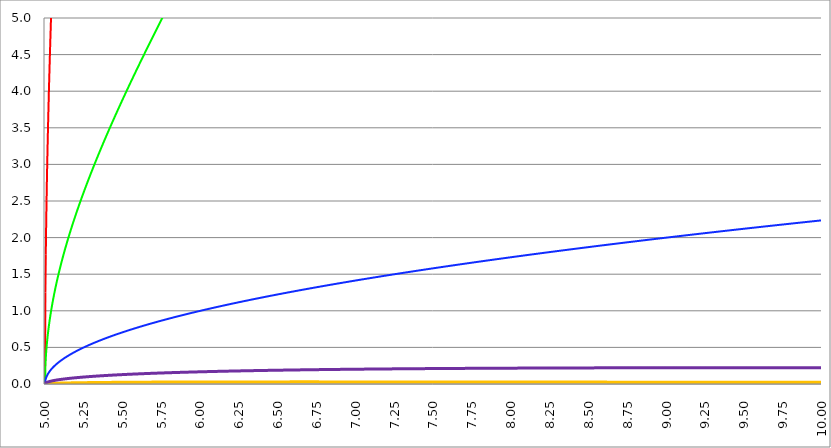
| Category | Series 1 | Series 0 | Series 2 | Series 3 | Series 4 |
|---|---|---|---|---|---|
| 5.0 | 0 | 0 | 0 | 0 | 0 |
| 5.0025 | 1.251 | 0.25 | 0.05 | 0.002 | 0.01 |
| 5.005000000000001 | 1.771 | 0.354 | 0.071 | 0.003 | 0.014 |
| 5.007500000000001 | 2.172 | 0.434 | 0.087 | 0.003 | 0.017 |
| 5.010000000000002 | 2.51 | 0.501 | 0.1 | 0.004 | 0.02 |
| 5.012500000000002 | 2.809 | 0.56 | 0.112 | 0.004 | 0.022 |
| 5.015000000000002 | 3.08 | 0.614 | 0.122 | 0.005 | 0.024 |
| 5.017500000000003 | 3.33 | 0.664 | 0.132 | 0.005 | 0.026 |
| 5.020000000000003 | 3.564 | 0.71 | 0.141 | 0.006 | 0.028 |
| 5.022500000000004 | 3.784 | 0.753 | 0.15 | 0.006 | 0.03 |
| 5.025000000000004 | 3.992 | 0.795 | 0.158 | 0.006 | 0.031 |
| 5.027500000000004 | 4.192 | 0.834 | 0.166 | 0.007 | 0.033 |
| 5.030000000000004 | 4.382 | 0.871 | 0.173 | 0.007 | 0.034 |
| 5.032500000000005 | 4.566 | 0.907 | 0.18 | 0.007 | 0.036 |
| 5.035000000000005 | 4.743 | 0.942 | 0.187 | 0.007 | 0.037 |
| 5.037500000000006 | 4.914 | 0.976 | 0.194 | 0.008 | 0.038 |
| 5.040000000000006 | 5.08 | 1.008 | 0.2 | 0.008 | 0.04 |
| 5.042500000000007 | 5.242 | 1.04 | 0.206 | 0.008 | 0.041 |
| 5.045000000000007 | 5.399 | 1.07 | 0.212 | 0.008 | 0.042 |
| 5.047500000000007 | 5.553 | 1.1 | 0.218 | 0.009 | 0.043 |
| 5.050000000000008 | 5.703 | 1.129 | 0.224 | 0.009 | 0.044 |
| 5.052500000000008 | 5.849 | 1.158 | 0.229 | 0.009 | 0.045 |
| 5.055000000000009 | 5.993 | 1.186 | 0.235 | 0.009 | 0.046 |
| 5.057500000000009 | 6.133 | 1.213 | 0.24 | 0.009 | 0.047 |
| 5.060000000000009 | 6.272 | 1.239 | 0.245 | 0.01 | 0.048 |
| 5.06250000000001 | 6.407 | 1.266 | 0.25 | 0.01 | 0.049 |
| 5.06500000000001 | 6.541 | 1.291 | 0.255 | 0.01 | 0.05 |
| 5.067500000000011 | 6.672 | 1.317 | 0.26 | 0.01 | 0.051 |
| 5.070000000000011 | 6.801 | 1.341 | 0.265 | 0.01 | 0.052 |
| 5.072500000000011 | 6.928 | 1.366 | 0.269 | 0.01 | 0.053 |
| 5.075000000000012 | 7.053 | 1.39 | 0.274 | 0.011 | 0.054 |
| 5.077500000000012 | 7.177 | 1.414 | 0.278 | 0.011 | 0.055 |
| 5.080000000000012 | 7.299 | 1.437 | 0.283 | 0.011 | 0.056 |
| 5.082500000000013 | 7.42 | 1.46 | 0.287 | 0.011 | 0.057 |
| 5.085000000000013 | 7.539 | 1.483 | 0.292 | 0.011 | 0.057 |
| 5.087500000000014 | 7.656 | 1.505 | 0.296 | 0.011 | 0.058 |
| 5.090000000000014 | 7.772 | 1.527 | 0.3 | 0.012 | 0.059 |
| 5.092500000000014 | 7.887 | 1.549 | 0.304 | 0.012 | 0.06 |
| 5.095000000000015 | 8.001 | 1.57 | 0.308 | 0.012 | 0.06 |
| 5.097500000000015 | 8.114 | 1.592 | 0.312 | 0.012 | 0.061 |
| 5.100000000000016 | 8.225 | 1.613 | 0.316 | 0.012 | 0.062 |
| 5.102500000000016 | 8.335 | 1.634 | 0.32 | 0.012 | 0.063 |
| 5.105000000000016 | 8.445 | 1.654 | 0.324 | 0.012 | 0.063 |
| 5.107500000000017 | 8.553 | 1.675 | 0.328 | 0.013 | 0.064 |
| 5.110000000000017 | 8.66 | 1.695 | 0.332 | 0.013 | 0.065 |
| 5.112500000000018 | 8.767 | 1.715 | 0.335 | 0.013 | 0.066 |
| 5.115000000000018 | 8.872 | 1.735 | 0.339 | 0.013 | 0.066 |
| 5.117500000000018 | 8.977 | 1.754 | 0.343 | 0.013 | 0.067 |
| 5.120000000000019 | 9.081 | 1.774 | 0.346 | 0.013 | 0.068 |
| 5.122500000000019 | 9.184 | 1.793 | 0.35 | 0.013 | 0.068 |
| 5.12500000000002 | 9.286 | 1.812 | 0.354 | 0.013 | 0.069 |
| 5.12750000000002 | 9.388 | 1.831 | 0.357 | 0.014 | 0.07 |
| 5.13000000000002 | 9.489 | 1.85 | 0.361 | 0.014 | 0.07 |
| 5.132500000000021 | 9.589 | 1.868 | 0.364 | 0.014 | 0.071 |
| 5.135000000000021 | 9.688 | 1.887 | 0.367 | 0.014 | 0.072 |
| 5.137500000000021 | 9.787 | 1.905 | 0.371 | 0.014 | 0.072 |
| 5.140000000000022 | 9.885 | 1.923 | 0.374 | 0.014 | 0.073 |
| 5.142500000000022 | 9.983 | 1.941 | 0.377 | 0.014 | 0.073 |
| 5.145000000000023 | 10.08 | 1.959 | 0.381 | 0.014 | 0.074 |
| 5.147500000000023 | 10.176 | 1.977 | 0.384 | 0.014 | 0.075 |
| 5.150000000000023 | 10.272 | 1.995 | 0.387 | 0.015 | 0.075 |
| 5.152500000000024 | 10.367 | 2.012 | 0.391 | 0.015 | 0.076 |
| 5.155000000000024 | 10.462 | 2.03 | 0.394 | 0.015 | 0.076 |
| 5.157500000000025 | 10.556 | 2.047 | 0.397 | 0.015 | 0.077 |
| 5.160000000000025 | 10.65 | 2.064 | 0.4 | 0.015 | 0.078 |
| 5.162500000000025 | 10.744 | 2.081 | 0.403 | 0.015 | 0.078 |
| 5.165000000000026 | 10.836 | 2.098 | 0.406 | 0.015 | 0.079 |
| 5.167500000000026 | 10.929 | 2.115 | 0.409 | 0.015 | 0.079 |
| 5.170000000000026 | 11.021 | 2.132 | 0.412 | 0.015 | 0.08 |
| 5.172500000000027 | 11.112 | 2.148 | 0.415 | 0.016 | 0.08 |
| 5.175000000000027 | 11.203 | 2.165 | 0.418 | 0.016 | 0.081 |
| 5.177500000000028 | 11.294 | 2.181 | 0.421 | 0.016 | 0.081 |
| 5.180000000000028 | 11.384 | 2.198 | 0.424 | 0.016 | 0.082 |
| 5.182500000000029 | 11.474 | 2.214 | 0.427 | 0.016 | 0.082 |
| 5.185000000000029 | 11.563 | 2.23 | 0.43 | 0.016 | 0.083 |
| 5.187500000000029 | 11.652 | 2.246 | 0.433 | 0.016 | 0.083 |
| 5.19000000000003 | 11.741 | 2.262 | 0.436 | 0.016 | 0.084 |
| 5.19250000000003 | 11.83 | 2.278 | 0.439 | 0.016 | 0.084 |
| 5.19500000000003 | 11.918 | 2.294 | 0.442 | 0.016 | 0.085 |
| 5.197500000000031 | 12.005 | 2.31 | 0.444 | 0.016 | 0.086 |
| 5.200000000000031 | 12.093 | 2.326 | 0.447 | 0.017 | 0.086 |
| 5.202500000000032 | 12.18 | 2.341 | 0.45 | 0.017 | 0.086 |
| 5.205000000000032 | 12.266 | 2.357 | 0.453 | 0.017 | 0.087 |
| 5.207500000000032 | 12.353 | 2.372 | 0.456 | 0.017 | 0.087 |
| 5.210000000000033 | 12.439 | 2.388 | 0.458 | 0.017 | 0.088 |
| 5.212500000000033 | 12.525 | 2.403 | 0.461 | 0.017 | 0.088 |
| 5.215000000000034 | 12.61 | 2.418 | 0.464 | 0.017 | 0.089 |
| 5.217500000000034 | 12.696 | 2.433 | 0.466 | 0.017 | 0.089 |
| 5.220000000000034 | 12.781 | 2.448 | 0.469 | 0.017 | 0.09 |
| 5.222500000000035 | 12.865 | 2.463 | 0.472 | 0.017 | 0.09 |
| 5.225000000000035 | 12.95 | 2.478 | 0.474 | 0.017 | 0.091 |
| 5.227500000000036 | 13.034 | 2.493 | 0.477 | 0.017 | 0.091 |
| 5.230000000000035 | 13.118 | 2.508 | 0.48 | 0.018 | 0.092 |
| 5.232500000000036 | 13.202 | 2.523 | 0.482 | 0.018 | 0.092 |
| 5.235000000000036 | 13.285 | 2.538 | 0.485 | 0.018 | 0.093 |
| 5.237500000000037 | 13.368 | 2.552 | 0.487 | 0.018 | 0.093 |
| 5.240000000000037 | 13.451 | 2.567 | 0.49 | 0.018 | 0.093 |
| 5.242500000000038 | 13.534 | 2.582 | 0.492 | 0.018 | 0.094 |
| 5.245000000000038 | 13.617 | 2.596 | 0.495 | 0.018 | 0.094 |
| 5.247500000000039 | 13.699 | 2.611 | 0.497 | 0.018 | 0.095 |
| 5.25000000000004 | 13.781 | 2.625 | 0.5 | 0.018 | 0.095 |
| 5.252500000000039 | 13.863 | 2.639 | 0.502 | 0.018 | 0.096 |
| 5.25500000000004 | 13.945 | 2.654 | 0.505 | 0.018 | 0.096 |
| 5.25750000000004 | 14.026 | 2.668 | 0.507 | 0.018 | 0.097 |
| 5.260000000000041 | 14.108 | 2.682 | 0.51 | 0.018 | 0.097 |
| 5.262500000000041 | 14.189 | 2.696 | 0.512 | 0.019 | 0.097 |
| 5.265000000000041 | 14.27 | 2.71 | 0.515 | 0.019 | 0.098 |
| 5.267500000000042 | 14.351 | 2.724 | 0.517 | 0.019 | 0.098 |
| 5.270000000000042 | 14.431 | 2.738 | 0.52 | 0.019 | 0.099 |
| 5.272500000000043 | 14.512 | 2.752 | 0.522 | 0.019 | 0.099 |
| 5.275000000000043 | 14.592 | 2.766 | 0.524 | 0.019 | 0.099 |
| 5.277500000000043 | 14.672 | 2.78 | 0.527 | 0.019 | 0.1 |
| 5.280000000000044 | 14.752 | 2.794 | 0.529 | 0.019 | 0.1 |
| 5.282500000000044 | 14.832 | 2.808 | 0.532 | 0.019 | 0.101 |
| 5.285000000000044 | 14.911 | 2.821 | 0.534 | 0.019 | 0.101 |
| 5.287500000000045 | 14.991 | 2.835 | 0.536 | 0.019 | 0.101 |
| 5.290000000000045 | 15.07 | 2.849 | 0.539 | 0.019 | 0.102 |
| 5.292500000000046 | 15.149 | 2.862 | 0.541 | 0.019 | 0.102 |
| 5.295000000000046 | 15.228 | 2.876 | 0.543 | 0.019 | 0.103 |
| 5.297500000000046 | 15.307 | 2.889 | 0.545 | 0.019 | 0.103 |
| 5.300000000000047 | 15.386 | 2.903 | 0.548 | 0.019 | 0.103 |
| 5.302500000000047 | 15.464 | 2.916 | 0.55 | 0.02 | 0.104 |
| 5.305000000000048 | 15.542 | 2.93 | 0.552 | 0.02 | 0.104 |
| 5.307500000000048 | 15.621 | 2.943 | 0.555 | 0.02 | 0.104 |
| 5.310000000000048 | 15.699 | 2.956 | 0.557 | 0.02 | 0.105 |
| 5.312500000000049 | 15.777 | 2.97 | 0.559 | 0.02 | 0.105 |
| 5.315000000000049 | 15.855 | 2.983 | 0.561 | 0.02 | 0.106 |
| 5.31750000000005 | 15.933 | 2.996 | 0.563 | 0.02 | 0.106 |
| 5.32000000000005 | 16.01 | 3.009 | 0.566 | 0.02 | 0.106 |
| 5.32250000000005 | 16.088 | 3.023 | 0.568 | 0.02 | 0.107 |
| 5.325000000000051 | 16.165 | 3.036 | 0.57 | 0.02 | 0.107 |
| 5.327500000000051 | 16.242 | 3.049 | 0.572 | 0.02 | 0.107 |
| 5.330000000000052 | 16.32 | 3.062 | 0.574 | 0.02 | 0.108 |
| 5.332500000000052 | 16.397 | 3.075 | 0.577 | 0.02 | 0.108 |
| 5.335000000000052 | 16.474 | 3.088 | 0.579 | 0.02 | 0.108 |
| 5.337500000000053 | 16.551 | 3.101 | 0.581 | 0.02 | 0.109 |
| 5.340000000000053 | 16.627 | 3.114 | 0.583 | 0.02 | 0.109 |
| 5.342500000000053 | 16.704 | 3.127 | 0.585 | 0.021 | 0.11 |
| 5.345000000000054 | 16.781 | 3.139 | 0.587 | 0.021 | 0.11 |
| 5.347500000000054 | 16.857 | 3.152 | 0.589 | 0.021 | 0.11 |
| 5.350000000000055 | 16.933 | 3.165 | 0.592 | 0.021 | 0.111 |
| 5.352500000000055 | 17.01 | 3.178 | 0.594 | 0.021 | 0.111 |
| 5.355000000000055 | 17.086 | 3.191 | 0.596 | 0.021 | 0.111 |
| 5.357500000000056 | 17.162 | 3.203 | 0.598 | 0.021 | 0.112 |
| 5.360000000000056 | 17.238 | 3.216 | 0.6 | 0.021 | 0.112 |
| 5.362500000000057 | 17.314 | 3.229 | 0.602 | 0.021 | 0.112 |
| 5.365000000000057 | 17.389 | 3.241 | 0.604 | 0.021 | 0.113 |
| 5.367500000000057 | 17.465 | 3.254 | 0.606 | 0.021 | 0.113 |
| 5.370000000000058 | 17.541 | 3.266 | 0.608 | 0.021 | 0.113 |
| 5.372500000000058 | 17.616 | 3.279 | 0.61 | 0.021 | 0.114 |
| 5.375000000000059 | 17.692 | 3.292 | 0.612 | 0.021 | 0.114 |
| 5.377500000000059 | 17.767 | 3.304 | 0.614 | 0.021 | 0.114 |
| 5.380000000000059 | 17.843 | 3.316 | 0.616 | 0.021 | 0.115 |
| 5.38250000000006 | 17.918 | 3.329 | 0.618 | 0.021 | 0.115 |
| 5.38500000000006 | 17.993 | 3.341 | 0.62 | 0.021 | 0.115 |
| 5.387500000000061 | 18.068 | 3.354 | 0.622 | 0.021 | 0.116 |
| 5.390000000000061 | 18.143 | 3.366 | 0.624 | 0.021 | 0.116 |
| 5.392500000000061 | 18.218 | 3.378 | 0.626 | 0.022 | 0.116 |
| 5.395000000000062 | 18.293 | 3.391 | 0.628 | 0.022 | 0.116 |
| 5.397500000000062 | 18.368 | 3.403 | 0.63 | 0.022 | 0.117 |
| 5.400000000000062 | 18.442 | 3.415 | 0.632 | 0.022 | 0.117 |
| 5.402500000000063 | 18.517 | 3.428 | 0.634 | 0.022 | 0.117 |
| 5.405000000000063 | 18.592 | 3.44 | 0.636 | 0.022 | 0.118 |
| 5.407500000000064 | 18.666 | 3.452 | 0.638 | 0.022 | 0.118 |
| 5.410000000000064 | 18.741 | 3.464 | 0.64 | 0.022 | 0.118 |
| 5.412500000000064 | 18.815 | 3.476 | 0.642 | 0.022 | 0.119 |
| 5.415000000000064 | 18.89 | 3.488 | 0.644 | 0.022 | 0.119 |
| 5.417500000000065 | 18.964 | 3.5 | 0.646 | 0.022 | 0.119 |
| 5.420000000000065 | 19.038 | 3.513 | 0.648 | 0.022 | 0.12 |
| 5.422500000000066 | 19.112 | 3.525 | 0.65 | 0.022 | 0.12 |
| 5.425000000000066 | 19.186 | 3.537 | 0.652 | 0.022 | 0.12 |
| 5.427500000000067 | 19.261 | 3.549 | 0.654 | 0.022 | 0.12 |
| 5.430000000000067 | 19.335 | 3.561 | 0.656 | 0.022 | 0.121 |
| 5.432500000000067 | 19.409 | 3.573 | 0.658 | 0.022 | 0.121 |
| 5.435000000000067 | 19.482 | 3.585 | 0.66 | 0.022 | 0.121 |
| 5.437500000000068 | 19.556 | 3.597 | 0.661 | 0.022 | 0.122 |
| 5.440000000000068 | 19.63 | 3.608 | 0.663 | 0.022 | 0.122 |
| 5.44250000000007 | 19.704 | 3.62 | 0.665 | 0.022 | 0.122 |
| 5.44500000000007 | 19.778 | 3.632 | 0.667 | 0.023 | 0.123 |
| 5.44750000000007 | 19.851 | 3.644 | 0.669 | 0.023 | 0.123 |
| 5.45000000000007 | 19.925 | 3.656 | 0.671 | 0.023 | 0.123 |
| 5.452500000000071 | 19.999 | 3.668 | 0.673 | 0.023 | 0.123 |
| 5.455000000000071 | 20.072 | 3.68 | 0.675 | 0.023 | 0.124 |
| 5.457500000000071 | 20.146 | 3.691 | 0.676 | 0.023 | 0.124 |
| 5.460000000000072 | 20.219 | 3.703 | 0.678 | 0.023 | 0.124 |
| 5.462500000000072 | 20.293 | 3.715 | 0.68 | 0.023 | 0.124 |
| 5.465000000000073 | 20.366 | 3.727 | 0.682 | 0.023 | 0.125 |
| 5.467500000000073 | 20.439 | 3.738 | 0.684 | 0.023 | 0.125 |
| 5.470000000000073 | 20.513 | 3.75 | 0.686 | 0.023 | 0.125 |
| 5.472500000000074 | 20.586 | 3.762 | 0.687 | 0.023 | 0.126 |
| 5.475000000000074 | 20.659 | 3.773 | 0.689 | 0.023 | 0.126 |
| 5.477500000000074 | 20.732 | 3.785 | 0.691 | 0.023 | 0.126 |
| 5.480000000000074 | 20.806 | 3.797 | 0.693 | 0.023 | 0.126 |
| 5.482500000000075 | 20.879 | 3.808 | 0.695 | 0.023 | 0.127 |
| 5.485000000000075 | 20.952 | 3.82 | 0.696 | 0.023 | 0.127 |
| 5.487500000000076 | 21.025 | 3.831 | 0.698 | 0.023 | 0.127 |
| 5.490000000000076 | 21.098 | 3.843 | 0.7 | 0.023 | 0.128 |
| 5.492500000000077 | 21.171 | 3.855 | 0.702 | 0.023 | 0.128 |
| 5.495000000000077 | 21.244 | 3.866 | 0.704 | 0.023 | 0.128 |
| 5.497500000000078 | 21.317 | 3.878 | 0.705 | 0.023 | 0.128 |
| 5.500000000000078 | 21.39 | 3.889 | 0.707 | 0.023 | 0.129 |
| 5.502500000000079 | 21.463 | 3.901 | 0.709 | 0.023 | 0.129 |
| 5.505000000000079 | 21.536 | 3.912 | 0.711 | 0.023 | 0.129 |
| 5.507500000000079 | 21.609 | 3.923 | 0.712 | 0.023 | 0.129 |
| 5.51000000000008 | 21.681 | 3.935 | 0.714 | 0.024 | 0.13 |
| 5.51250000000008 | 21.754 | 3.946 | 0.716 | 0.024 | 0.13 |
| 5.515000000000081 | 21.827 | 3.958 | 0.718 | 0.024 | 0.13 |
| 5.517500000000081 | 21.9 | 3.969 | 0.719 | 0.024 | 0.13 |
| 5.520000000000081 | 21.973 | 3.981 | 0.721 | 0.024 | 0.131 |
| 5.522500000000082 | 22.045 | 3.992 | 0.723 | 0.024 | 0.131 |
| 5.525000000000082 | 22.118 | 4.003 | 0.725 | 0.024 | 0.131 |
| 5.527500000000082 | 22.191 | 4.015 | 0.726 | 0.024 | 0.131 |
| 5.530000000000083 | 22.263 | 4.026 | 0.728 | 0.024 | 0.132 |
| 5.532500000000083 | 22.336 | 4.037 | 0.73 | 0.024 | 0.132 |
| 5.535000000000084 | 22.408 | 4.049 | 0.731 | 0.024 | 0.132 |
| 5.537500000000084 | 22.481 | 4.06 | 0.733 | 0.024 | 0.132 |
| 5.540000000000084 | 22.554 | 4.071 | 0.735 | 0.024 | 0.133 |
| 5.542500000000085 | 22.626 | 4.082 | 0.737 | 0.024 | 0.133 |
| 5.545000000000085 | 22.699 | 4.094 | 0.738 | 0.024 | 0.133 |
| 5.547500000000086 | 22.771 | 4.105 | 0.74 | 0.024 | 0.133 |
| 5.550000000000086 | 22.844 | 4.116 | 0.742 | 0.024 | 0.134 |
| 5.552500000000086 | 22.916 | 4.127 | 0.743 | 0.024 | 0.134 |
| 5.555000000000087 | 22.989 | 4.138 | 0.745 | 0.024 | 0.134 |
| 5.557500000000087 | 23.061 | 4.15 | 0.747 | 0.024 | 0.134 |
| 5.560000000000088 | 23.134 | 4.161 | 0.748 | 0.024 | 0.135 |
| 5.562500000000088 | 23.206 | 4.172 | 0.75 | 0.024 | 0.135 |
| 5.565000000000088 | 23.278 | 4.183 | 0.752 | 0.024 | 0.135 |
| 5.567500000000089 | 23.351 | 4.194 | 0.753 | 0.024 | 0.135 |
| 5.57000000000009 | 23.423 | 4.205 | 0.755 | 0.024 | 0.136 |
| 5.572500000000089 | 23.496 | 4.216 | 0.757 | 0.024 | 0.136 |
| 5.57500000000009 | 23.568 | 4.227 | 0.758 | 0.024 | 0.136 |
| 5.57750000000009 | 23.64 | 4.239 | 0.76 | 0.024 | 0.136 |
| 5.580000000000091 | 23.713 | 4.25 | 0.762 | 0.024 | 0.136 |
| 5.582500000000091 | 23.785 | 4.261 | 0.763 | 0.024 | 0.137 |
| 5.585000000000091 | 23.857 | 4.272 | 0.765 | 0.025 | 0.137 |
| 5.587500000000092 | 23.93 | 4.283 | 0.766 | 0.025 | 0.137 |
| 5.590000000000092 | 24.002 | 4.294 | 0.768 | 0.025 | 0.137 |
| 5.592500000000093 | 24.074 | 4.305 | 0.77 | 0.025 | 0.138 |
| 5.595000000000093 | 24.147 | 4.316 | 0.771 | 0.025 | 0.138 |
| 5.597500000000093 | 24.219 | 4.327 | 0.773 | 0.025 | 0.138 |
| 5.600000000000094 | 24.291 | 4.338 | 0.775 | 0.025 | 0.138 |
| 5.602500000000094 | 24.364 | 4.349 | 0.776 | 0.025 | 0.139 |
| 5.605000000000094 | 24.436 | 4.36 | 0.778 | 0.025 | 0.139 |
| 5.607500000000095 | 24.508 | 4.371 | 0.779 | 0.025 | 0.139 |
| 5.610000000000095 | 24.58 | 4.382 | 0.781 | 0.025 | 0.139 |
| 5.612500000000096 | 24.653 | 4.392 | 0.783 | 0.025 | 0.139 |
| 5.615000000000096 | 24.725 | 4.403 | 0.784 | 0.025 | 0.14 |
| 5.617500000000096 | 24.797 | 4.414 | 0.786 | 0.025 | 0.14 |
| 5.620000000000097 | 24.87 | 4.425 | 0.787 | 0.025 | 0.14 |
| 5.622500000000097 | 24.942 | 4.436 | 0.789 | 0.025 | 0.14 |
| 5.625000000000098 | 25.014 | 4.447 | 0.791 | 0.025 | 0.141 |
| 5.627500000000098 | 25.086 | 4.458 | 0.792 | 0.025 | 0.141 |
| 5.630000000000098 | 25.159 | 4.469 | 0.794 | 0.025 | 0.141 |
| 5.632500000000099 | 25.231 | 4.48 | 0.795 | 0.025 | 0.141 |
| 5.635000000000099 | 25.303 | 4.49 | 0.797 | 0.025 | 0.141 |
| 5.6375000000001 | 25.375 | 4.501 | 0.798 | 0.025 | 0.142 |
| 5.6400000000001 | 25.448 | 4.512 | 0.8 | 0.025 | 0.142 |
| 5.6425000000001 | 25.52 | 4.523 | 0.802 | 0.025 | 0.142 |
| 5.645000000000101 | 25.592 | 4.534 | 0.803 | 0.025 | 0.142 |
| 5.647500000000101 | 25.664 | 4.544 | 0.805 | 0.025 | 0.142 |
| 5.650000000000102 | 25.737 | 4.555 | 0.806 | 0.025 | 0.143 |
| 5.652500000000102 | 25.809 | 4.566 | 0.808 | 0.025 | 0.143 |
| 5.655000000000102 | 25.881 | 4.577 | 0.809 | 0.025 | 0.143 |
| 5.657500000000103 | 25.954 | 4.587 | 0.811 | 0.025 | 0.143 |
| 5.660000000000103 | 26.026 | 4.598 | 0.812 | 0.025 | 0.144 |
| 5.662500000000103 | 26.098 | 4.609 | 0.814 | 0.025 | 0.144 |
| 5.665000000000104 | 26.17 | 4.62 | 0.815 | 0.025 | 0.144 |
| 5.667500000000104 | 26.243 | 4.63 | 0.817 | 0.025 | 0.144 |
| 5.670000000000104 | 26.315 | 4.641 | 0.819 | 0.025 | 0.144 |
| 5.672500000000105 | 26.387 | 4.652 | 0.82 | 0.025 | 0.145 |
| 5.675000000000105 | 26.46 | 4.662 | 0.822 | 0.026 | 0.145 |
| 5.677500000000106 | 26.532 | 4.673 | 0.823 | 0.026 | 0.145 |
| 5.680000000000106 | 26.604 | 4.684 | 0.825 | 0.026 | 0.145 |
| 5.682500000000107 | 26.677 | 4.695 | 0.826 | 0.026 | 0.145 |
| 5.685000000000107 | 26.749 | 4.705 | 0.828 | 0.026 | 0.146 |
| 5.687500000000107 | 26.821 | 4.716 | 0.829 | 0.026 | 0.146 |
| 5.690000000000108 | 26.894 | 4.726 | 0.831 | 0.026 | 0.146 |
| 5.692500000000108 | 26.966 | 4.737 | 0.832 | 0.026 | 0.146 |
| 5.695000000000109 | 27.038 | 4.748 | 0.834 | 0.026 | 0.146 |
| 5.697500000000109 | 27.111 | 4.758 | 0.835 | 0.026 | 0.147 |
| 5.70000000000011 | 27.183 | 4.769 | 0.837 | 0.026 | 0.147 |
| 5.70250000000011 | 27.255 | 4.78 | 0.838 | 0.026 | 0.147 |
| 5.70500000000011 | 27.328 | 4.79 | 0.84 | 0.026 | 0.147 |
| 5.707500000000111 | 27.4 | 4.801 | 0.841 | 0.026 | 0.147 |
| 5.710000000000111 | 27.473 | 4.811 | 0.843 | 0.026 | 0.148 |
| 5.712500000000111 | 27.545 | 4.822 | 0.844 | 0.026 | 0.148 |
| 5.715000000000112 | 27.618 | 4.832 | 0.846 | 0.026 | 0.148 |
| 5.717500000000112 | 27.69 | 4.843 | 0.847 | 0.026 | 0.148 |
| 5.720000000000112 | 27.762 | 4.854 | 0.849 | 0.026 | 0.148 |
| 5.722500000000113 | 27.835 | 4.864 | 0.85 | 0.026 | 0.149 |
| 5.725000000000113 | 27.907 | 4.875 | 0.851 | 0.026 | 0.149 |
| 5.727500000000114 | 27.98 | 4.885 | 0.853 | 0.026 | 0.149 |
| 5.730000000000114 | 28.052 | 4.896 | 0.854 | 0.026 | 0.149 |
| 5.732500000000114 | 28.125 | 4.906 | 0.856 | 0.026 | 0.149 |
| 5.735000000000114 | 28.197 | 4.917 | 0.857 | 0.026 | 0.149 |
| 5.737500000000115 | 28.27 | 4.927 | 0.859 | 0.026 | 0.15 |
| 5.740000000000115 | 28.343 | 4.938 | 0.86 | 0.026 | 0.15 |
| 5.742500000000116 | 28.415 | 4.948 | 0.862 | 0.026 | 0.15 |
| 5.745000000000116 | 28.488 | 4.959 | 0.863 | 0.026 | 0.15 |
| 5.747500000000117 | 28.56 | 4.969 | 0.865 | 0.026 | 0.15 |
| 5.750000000000117 | 28.633 | 4.98 | 0.866 | 0.026 | 0.151 |
| 5.752500000000118 | 28.706 | 4.99 | 0.867 | 0.026 | 0.151 |
| 5.755000000000118 | 28.778 | 5.001 | 0.869 | 0.026 | 0.151 |
| 5.757500000000118 | 28.851 | 5.011 | 0.87 | 0.026 | 0.151 |
| 5.760000000000119 | 28.924 | 5.021 | 0.872 | 0.026 | 0.151 |
| 5.762500000000119 | 28.996 | 5.032 | 0.873 | 0.026 | 0.152 |
| 5.76500000000012 | 29.069 | 5.042 | 0.875 | 0.026 | 0.152 |
| 5.76750000000012 | 29.142 | 5.053 | 0.876 | 0.026 | 0.152 |
| 5.77000000000012 | 29.214 | 5.063 | 0.877 | 0.026 | 0.152 |
| 5.77250000000012 | 29.287 | 5.074 | 0.879 | 0.026 | 0.152 |
| 5.77500000000012 | 29.36 | 5.084 | 0.88 | 0.026 | 0.152 |
| 5.777500000000121 | 29.433 | 5.094 | 0.882 | 0.026 | 0.153 |
| 5.780000000000121 | 29.505 | 5.105 | 0.883 | 0.026 | 0.153 |
| 5.782500000000122 | 29.578 | 5.115 | 0.885 | 0.026 | 0.153 |
| 5.785000000000122 | 29.651 | 5.126 | 0.886 | 0.026 | 0.153 |
| 5.787500000000123 | 29.724 | 5.136 | 0.887 | 0.026 | 0.153 |
| 5.790000000000123 | 29.797 | 5.146 | 0.889 | 0.027 | 0.154 |
| 5.792500000000124 | 29.87 | 5.157 | 0.89 | 0.027 | 0.154 |
| 5.795000000000124 | 29.943 | 5.167 | 0.892 | 0.027 | 0.154 |
| 5.797500000000124 | 30.016 | 5.177 | 0.893 | 0.027 | 0.154 |
| 5.800000000000125 | 30.089 | 5.188 | 0.894 | 0.027 | 0.154 |
| 5.802500000000125 | 30.161 | 5.198 | 0.896 | 0.027 | 0.154 |
| 5.805000000000125 | 30.234 | 5.208 | 0.897 | 0.027 | 0.155 |
| 5.807500000000126 | 30.307 | 5.219 | 0.899 | 0.027 | 0.155 |
| 5.810000000000126 | 30.38 | 5.229 | 0.9 | 0.027 | 0.155 |
| 5.812500000000127 | 30.454 | 5.239 | 0.901 | 0.027 | 0.155 |
| 5.815000000000127 | 30.527 | 5.25 | 0.903 | 0.027 | 0.155 |
| 5.817500000000128 | 30.6 | 5.26 | 0.904 | 0.027 | 0.155 |
| 5.820000000000128 | 30.673 | 5.27 | 0.906 | 0.027 | 0.156 |
| 5.822500000000129 | 30.746 | 5.281 | 0.907 | 0.027 | 0.156 |
| 5.825000000000129 | 30.819 | 5.291 | 0.908 | 0.027 | 0.156 |
| 5.827500000000129 | 30.892 | 5.301 | 0.91 | 0.027 | 0.156 |
| 5.83000000000013 | 30.965 | 5.311 | 0.911 | 0.027 | 0.156 |
| 5.83250000000013 | 31.039 | 5.322 | 0.912 | 0.027 | 0.156 |
| 5.83500000000013 | 31.112 | 5.332 | 0.914 | 0.027 | 0.157 |
| 5.837500000000131 | 31.185 | 5.342 | 0.915 | 0.027 | 0.157 |
| 5.840000000000131 | 31.258 | 5.352 | 0.917 | 0.027 | 0.157 |
| 5.842500000000132 | 31.332 | 5.363 | 0.918 | 0.027 | 0.157 |
| 5.845000000000132 | 31.405 | 5.373 | 0.919 | 0.027 | 0.157 |
| 5.847500000000132 | 31.478 | 5.383 | 0.921 | 0.027 | 0.157 |
| 5.850000000000133 | 31.552 | 5.393 | 0.922 | 0.027 | 0.158 |
| 5.852500000000133 | 31.625 | 5.404 | 0.923 | 0.027 | 0.158 |
| 5.855000000000134 | 31.698 | 5.414 | 0.925 | 0.027 | 0.158 |
| 5.857500000000134 | 31.772 | 5.424 | 0.926 | 0.027 | 0.158 |
| 5.860000000000134 | 31.845 | 5.434 | 0.927 | 0.027 | 0.158 |
| 5.862500000000135 | 31.919 | 5.445 | 0.929 | 0.027 | 0.158 |
| 5.865000000000135 | 31.992 | 5.455 | 0.93 | 0.027 | 0.159 |
| 5.867500000000136 | 32.066 | 5.465 | 0.931 | 0.027 | 0.159 |
| 5.870000000000135 | 32.139 | 5.475 | 0.933 | 0.027 | 0.159 |
| 5.872500000000136 | 32.213 | 5.485 | 0.934 | 0.027 | 0.159 |
| 5.875000000000136 | 32.286 | 5.496 | 0.935 | 0.027 | 0.159 |
| 5.877500000000137 | 32.36 | 5.506 | 0.937 | 0.027 | 0.159 |
| 5.880000000000137 | 32.434 | 5.516 | 0.938 | 0.027 | 0.16 |
| 5.882500000000138 | 32.507 | 5.526 | 0.939 | 0.027 | 0.16 |
| 5.885000000000138 | 32.581 | 5.536 | 0.941 | 0.027 | 0.16 |
| 5.887500000000139 | 32.655 | 5.546 | 0.942 | 0.027 | 0.16 |
| 5.89000000000014 | 32.728 | 5.557 | 0.943 | 0.027 | 0.16 |
| 5.892500000000139 | 32.802 | 5.567 | 0.945 | 0.027 | 0.16 |
| 5.89500000000014 | 32.876 | 5.577 | 0.946 | 0.027 | 0.16 |
| 5.89750000000014 | 32.95 | 5.587 | 0.947 | 0.027 | 0.161 |
| 5.90000000000014 | 33.024 | 5.597 | 0.949 | 0.027 | 0.161 |
| 5.902500000000141 | 33.098 | 5.607 | 0.95 | 0.027 | 0.161 |
| 5.905000000000141 | 33.171 | 5.618 | 0.951 | 0.027 | 0.161 |
| 5.907500000000142 | 33.245 | 5.628 | 0.953 | 0.027 | 0.161 |
| 5.910000000000142 | 33.319 | 5.638 | 0.954 | 0.027 | 0.161 |
| 5.912500000000143 | 33.393 | 5.648 | 0.955 | 0.027 | 0.162 |
| 5.915000000000143 | 33.467 | 5.658 | 0.957 | 0.027 | 0.162 |
| 5.917500000000143 | 33.541 | 5.668 | 0.958 | 0.027 | 0.162 |
| 5.920000000000144 | 33.615 | 5.678 | 0.959 | 0.027 | 0.162 |
| 5.922500000000144 | 33.689 | 5.688 | 0.96 | 0.027 | 0.162 |
| 5.925000000000144 | 33.764 | 5.698 | 0.962 | 0.027 | 0.162 |
| 5.927500000000145 | 33.838 | 5.709 | 0.963 | 0.027 | 0.162 |
| 5.930000000000145 | 33.912 | 5.719 | 0.964 | 0.027 | 0.163 |
| 5.932500000000145 | 33.986 | 5.729 | 0.966 | 0.027 | 0.163 |
| 5.935000000000146 | 34.06 | 5.739 | 0.967 | 0.027 | 0.163 |
| 5.937500000000146 | 34.134 | 5.749 | 0.968 | 0.027 | 0.163 |
| 5.940000000000146 | 34.209 | 5.759 | 0.97 | 0.027 | 0.163 |
| 5.942500000000147 | 34.283 | 5.769 | 0.971 | 0.027 | 0.163 |
| 5.945000000000147 | 34.357 | 5.779 | 0.972 | 0.028 | 0.164 |
| 5.947500000000148 | 34.432 | 5.789 | 0.973 | 0.028 | 0.164 |
| 5.950000000000148 | 34.506 | 5.799 | 0.975 | 0.028 | 0.164 |
| 5.952500000000149 | 34.581 | 5.809 | 0.976 | 0.028 | 0.164 |
| 5.95500000000015 | 34.655 | 5.819 | 0.977 | 0.028 | 0.164 |
| 5.95750000000015 | 34.729 | 5.83 | 0.979 | 0.028 | 0.164 |
| 5.96000000000015 | 34.804 | 5.84 | 0.98 | 0.028 | 0.164 |
| 5.96250000000015 | 34.878 | 5.85 | 0.981 | 0.028 | 0.165 |
| 5.965000000000151 | 34.953 | 5.86 | 0.982 | 0.028 | 0.165 |
| 5.967500000000151 | 35.028 | 5.87 | 0.984 | 0.028 | 0.165 |
| 5.970000000000151 | 35.102 | 5.88 | 0.985 | 0.028 | 0.165 |
| 5.972500000000152 | 35.177 | 5.89 | 0.986 | 0.028 | 0.165 |
| 5.975000000000152 | 35.252 | 5.9 | 0.987 | 0.028 | 0.165 |
| 5.977500000000153 | 35.326 | 5.91 | 0.989 | 0.028 | 0.165 |
| 5.980000000000153 | 35.401 | 5.92 | 0.99 | 0.028 | 0.166 |
| 5.982500000000154 | 35.476 | 5.93 | 0.991 | 0.028 | 0.166 |
| 5.985000000000154 | 35.551 | 5.94 | 0.992 | 0.028 | 0.166 |
| 5.987500000000154 | 35.625 | 5.95 | 0.994 | 0.028 | 0.166 |
| 5.990000000000154 | 35.7 | 5.96 | 0.995 | 0.028 | 0.166 |
| 5.992500000000155 | 35.775 | 5.97 | 0.996 | 0.028 | 0.166 |
| 5.995000000000155 | 35.85 | 5.98 | 0.997 | 0.028 | 0.166 |
| 5.997500000000156 | 35.925 | 5.99 | 0.999 | 0.028 | 0.167 |
| 6.000000000000156 | 36 | 6 | 1 | 0.028 | 0.167 |
| 6.002500000000157 | 36.075 | 6.01 | 1.001 | 0.028 | 0.167 |
| 6.005000000000157 | 36.15 | 6.02 | 1.002 | 0.028 | 0.167 |
| 6.007500000000157 | 36.225 | 6.03 | 1.004 | 0.028 | 0.167 |
| 6.010000000000158 | 36.3 | 6.04 | 1.005 | 0.028 | 0.167 |
| 6.012500000000158 | 36.375 | 6.05 | 1.006 | 0.028 | 0.167 |
| 6.015000000000159 | 36.451 | 6.06 | 1.007 | 0.028 | 0.167 |
| 6.017500000000159 | 36.526 | 6.07 | 1.009 | 0.028 | 0.168 |
| 6.020000000000159 | 36.601 | 6.08 | 1.01 | 0.028 | 0.168 |
| 6.02250000000016 | 36.676 | 6.09 | 1.011 | 0.028 | 0.168 |
| 6.02500000000016 | 36.752 | 6.1 | 1.012 | 0.028 | 0.168 |
| 6.027500000000161 | 36.827 | 6.11 | 1.014 | 0.028 | 0.168 |
| 6.03000000000016 | 36.902 | 6.12 | 1.015 | 0.028 | 0.168 |
| 6.032500000000161 | 36.978 | 6.13 | 1.016 | 0.028 | 0.168 |
| 6.035000000000161 | 37.053 | 6.14 | 1.017 | 0.028 | 0.169 |
| 6.037500000000162 | 37.129 | 6.15 | 1.019 | 0.028 | 0.169 |
| 6.040000000000162 | 37.204 | 6.16 | 1.02 | 0.028 | 0.169 |
| 6.042500000000163 | 37.28 | 6.17 | 1.021 | 0.028 | 0.169 |
| 6.045000000000163 | 37.355 | 6.18 | 1.022 | 0.028 | 0.169 |
| 6.047500000000164 | 37.431 | 6.189 | 1.023 | 0.028 | 0.169 |
| 6.050000000000164 | 37.506 | 6.199 | 1.025 | 0.028 | 0.169 |
| 6.052500000000164 | 37.582 | 6.209 | 1.026 | 0.028 | 0.17 |
| 6.055000000000164 | 37.658 | 6.219 | 1.027 | 0.028 | 0.17 |
| 6.057500000000165 | 37.733 | 6.229 | 1.028 | 0.028 | 0.17 |
| 6.060000000000165 | 37.809 | 6.239 | 1.03 | 0.028 | 0.17 |
| 6.062500000000166 | 37.885 | 6.249 | 1.031 | 0.028 | 0.17 |
| 6.065000000000166 | 37.961 | 6.259 | 1.032 | 0.028 | 0.17 |
| 6.067500000000167 | 38.037 | 6.269 | 1.033 | 0.028 | 0.17 |
| 6.070000000000167 | 38.113 | 6.279 | 1.034 | 0.028 | 0.17 |
| 6.072500000000167 | 38.189 | 6.289 | 1.036 | 0.028 | 0.171 |
| 6.075000000000168 | 38.265 | 6.299 | 1.037 | 0.028 | 0.171 |
| 6.077500000000168 | 38.341 | 6.309 | 1.038 | 0.028 | 0.171 |
| 6.080000000000168 | 38.417 | 6.319 | 1.039 | 0.028 | 0.171 |
| 6.08250000000017 | 38.493 | 6.328 | 1.04 | 0.028 | 0.171 |
| 6.08500000000017 | 38.569 | 6.338 | 1.042 | 0.028 | 0.171 |
| 6.08750000000017 | 38.645 | 6.348 | 1.043 | 0.028 | 0.171 |
| 6.09000000000017 | 38.721 | 6.358 | 1.044 | 0.028 | 0.171 |
| 6.092500000000171 | 38.797 | 6.368 | 1.045 | 0.028 | 0.172 |
| 6.095000000000171 | 38.874 | 6.378 | 1.046 | 0.028 | 0.172 |
| 6.097500000000172 | 38.95 | 6.388 | 1.048 | 0.028 | 0.172 |
| 6.100000000000172 | 39.026 | 6.398 | 1.049 | 0.028 | 0.172 |
| 6.102500000000172 | 39.103 | 6.408 | 1.05 | 0.028 | 0.172 |
| 6.105000000000173 | 39.179 | 6.418 | 1.051 | 0.028 | 0.172 |
| 6.107500000000173 | 39.255 | 6.427 | 1.052 | 0.028 | 0.172 |
| 6.110000000000174 | 39.332 | 6.437 | 1.054 | 0.028 | 0.172 |
| 6.112500000000174 | 39.408 | 6.447 | 1.055 | 0.028 | 0.173 |
| 6.115000000000174 | 39.485 | 6.457 | 1.056 | 0.028 | 0.173 |
| 6.117500000000175 | 39.561 | 6.467 | 1.057 | 0.028 | 0.173 |
| 6.120000000000175 | 39.638 | 6.477 | 1.058 | 0.028 | 0.173 |
| 6.122500000000175 | 39.715 | 6.487 | 1.059 | 0.028 | 0.173 |
| 6.125000000000176 | 39.791 | 6.497 | 1.061 | 0.028 | 0.173 |
| 6.127500000000176 | 39.868 | 6.506 | 1.062 | 0.028 | 0.173 |
| 6.130000000000176 | 39.945 | 6.516 | 1.063 | 0.028 | 0.173 |
| 6.132500000000177 | 40.022 | 6.526 | 1.064 | 0.028 | 0.174 |
| 6.135000000000177 | 40.098 | 6.536 | 1.065 | 0.028 | 0.174 |
| 6.137500000000178 | 40.175 | 6.546 | 1.067 | 0.028 | 0.174 |
| 6.140000000000178 | 40.252 | 6.556 | 1.068 | 0.028 | 0.174 |
| 6.142500000000179 | 40.329 | 6.566 | 1.069 | 0.028 | 0.174 |
| 6.145000000000179 | 40.406 | 6.575 | 1.07 | 0.028 | 0.174 |
| 6.147500000000179 | 40.483 | 6.585 | 1.071 | 0.028 | 0.174 |
| 6.15000000000018 | 40.56 | 6.595 | 1.072 | 0.028 | 0.174 |
| 6.15250000000018 | 40.637 | 6.605 | 1.074 | 0.028 | 0.174 |
| 6.155000000000181 | 40.714 | 6.615 | 1.075 | 0.028 | 0.175 |
| 6.157500000000181 | 40.791 | 6.625 | 1.076 | 0.028 | 0.175 |
| 6.160000000000181 | 40.869 | 6.635 | 1.077 | 0.028 | 0.175 |
| 6.162500000000182 | 40.946 | 6.644 | 1.078 | 0.028 | 0.175 |
| 6.165000000000182 | 41.023 | 6.654 | 1.079 | 0.028 | 0.175 |
| 6.167500000000182 | 41.1 | 6.664 | 1.081 | 0.028 | 0.175 |
| 6.170000000000183 | 41.178 | 6.674 | 1.082 | 0.028 | 0.175 |
| 6.172500000000183 | 41.255 | 6.684 | 1.083 | 0.028 | 0.175 |
| 6.175000000000184 | 41.333 | 6.694 | 1.084 | 0.028 | 0.176 |
| 6.177500000000184 | 41.41 | 6.703 | 1.085 | 0.028 | 0.176 |
| 6.180000000000184 | 41.488 | 6.713 | 1.086 | 0.028 | 0.176 |
| 6.182500000000185 | 41.565 | 6.723 | 1.087 | 0.028 | 0.176 |
| 6.185000000000185 | 41.643 | 6.733 | 1.089 | 0.028 | 0.176 |
| 6.187500000000186 | 41.72 | 6.743 | 1.09 | 0.028 | 0.176 |
| 6.190000000000186 | 41.798 | 6.752 | 1.091 | 0.028 | 0.176 |
| 6.192500000000186 | 41.876 | 6.762 | 1.092 | 0.028 | 0.176 |
| 6.195000000000187 | 41.953 | 6.772 | 1.093 | 0.028 | 0.176 |
| 6.197500000000187 | 42.031 | 6.782 | 1.094 | 0.028 | 0.177 |
| 6.200000000000187 | 42.109 | 6.792 | 1.095 | 0.028 | 0.177 |
| 6.202500000000188 | 42.187 | 6.802 | 1.097 | 0.029 | 0.177 |
| 6.205000000000188 | 42.265 | 6.811 | 1.098 | 0.029 | 0.177 |
| 6.207500000000189 | 42.343 | 6.821 | 1.099 | 0.029 | 0.177 |
| 6.21000000000019 | 42.421 | 6.831 | 1.1 | 0.029 | 0.177 |
| 6.21250000000019 | 42.499 | 6.841 | 1.101 | 0.029 | 0.177 |
| 6.21500000000019 | 42.577 | 6.851 | 1.102 | 0.029 | 0.177 |
| 6.21750000000019 | 42.655 | 6.86 | 1.103 | 0.029 | 0.177 |
| 6.220000000000191 | 42.733 | 6.87 | 1.105 | 0.029 | 0.178 |
| 6.222500000000191 | 42.811 | 6.88 | 1.106 | 0.029 | 0.178 |
| 6.225000000000191 | 42.889 | 6.89 | 1.107 | 0.029 | 0.178 |
| 6.227500000000192 | 42.967 | 6.9 | 1.108 | 0.029 | 0.178 |
| 6.230000000000192 | 43.046 | 6.909 | 1.109 | 0.029 | 0.178 |
| 6.232500000000193 | 43.124 | 6.919 | 1.11 | 0.029 | 0.178 |
| 6.235000000000193 | 43.202 | 6.929 | 1.111 | 0.029 | 0.178 |
| 6.237500000000193 | 43.281 | 6.939 | 1.112 | 0.029 | 0.178 |
| 6.240000000000194 | 43.359 | 6.949 | 1.114 | 0.029 | 0.178 |
| 6.242500000000194 | 43.438 | 6.958 | 1.115 | 0.029 | 0.179 |
| 6.245000000000194 | 43.516 | 6.968 | 1.116 | 0.029 | 0.179 |
| 6.247500000000195 | 43.595 | 6.978 | 1.117 | 0.029 | 0.179 |
| 6.250000000000195 | 43.673 | 6.988 | 1.118 | 0.029 | 0.179 |
| 6.252500000000196 | 43.752 | 6.997 | 1.119 | 0.029 | 0.179 |
| 6.255000000000196 | 43.831 | 7.007 | 1.12 | 0.029 | 0.179 |
| 6.257500000000197 | 43.909 | 7.017 | 1.121 | 0.029 | 0.179 |
| 6.260000000000197 | 43.988 | 7.027 | 1.122 | 0.029 | 0.179 |
| 6.262500000000197 | 44.067 | 7.037 | 1.124 | 0.029 | 0.179 |
| 6.265000000000198 | 44.146 | 7.046 | 1.125 | 0.029 | 0.18 |
| 6.267500000000198 | 44.224 | 7.056 | 1.126 | 0.029 | 0.18 |
| 6.270000000000198 | 44.303 | 7.066 | 1.127 | 0.029 | 0.18 |
| 6.272500000000199 | 44.382 | 7.076 | 1.128 | 0.029 | 0.18 |
| 6.2750000000002 | 44.461 | 7.085 | 1.129 | 0.029 | 0.18 |
| 6.2775000000002 | 44.54 | 7.095 | 1.13 | 0.029 | 0.18 |
| 6.2800000000002 | 44.619 | 7.105 | 1.131 | 0.029 | 0.18 |
| 6.2825000000002 | 44.699 | 7.115 | 1.132 | 0.029 | 0.18 |
| 6.285000000000201 | 44.778 | 7.125 | 1.134 | 0.029 | 0.18 |
| 6.287500000000201 | 44.857 | 7.134 | 1.135 | 0.029 | 0.18 |
| 6.290000000000202 | 44.936 | 7.144 | 1.136 | 0.029 | 0.181 |
| 6.292500000000202 | 45.015 | 7.154 | 1.137 | 0.029 | 0.181 |
| 6.295000000000202 | 45.095 | 7.164 | 1.138 | 0.029 | 0.181 |
| 6.297500000000203 | 45.174 | 7.173 | 1.139 | 0.029 | 0.181 |
| 6.300000000000203 | 45.254 | 7.183 | 1.14 | 0.029 | 0.181 |
| 6.302500000000204 | 45.333 | 7.193 | 1.141 | 0.029 | 0.181 |
| 6.305000000000204 | 45.413 | 7.203 | 1.142 | 0.029 | 0.181 |
| 6.307500000000204 | 45.492 | 7.212 | 1.143 | 0.029 | 0.181 |
| 6.310000000000205 | 45.572 | 7.222 | 1.145 | 0.029 | 0.181 |
| 6.312500000000205 | 45.651 | 7.232 | 1.146 | 0.029 | 0.181 |
| 6.315000000000206 | 45.731 | 7.242 | 1.147 | 0.029 | 0.182 |
| 6.317500000000206 | 45.811 | 7.251 | 1.148 | 0.029 | 0.182 |
| 6.320000000000206 | 45.89 | 7.261 | 1.149 | 0.029 | 0.182 |
| 6.322500000000207 | 45.97 | 7.271 | 1.15 | 0.029 | 0.182 |
| 6.325000000000207 | 46.05 | 7.281 | 1.151 | 0.029 | 0.182 |
| 6.327500000000207 | 46.13 | 7.29 | 1.152 | 0.029 | 0.182 |
| 6.330000000000208 | 46.21 | 7.3 | 1.153 | 0.029 | 0.182 |
| 6.332500000000208 | 46.29 | 7.31 | 1.154 | 0.029 | 0.182 |
| 6.335000000000209 | 46.37 | 7.32 | 1.155 | 0.029 | 0.182 |
| 6.337500000000209 | 46.45 | 7.329 | 1.157 | 0.029 | 0.182 |
| 6.340000000000209 | 46.53 | 7.339 | 1.158 | 0.029 | 0.183 |
| 6.34250000000021 | 46.61 | 7.349 | 1.159 | 0.029 | 0.183 |
| 6.34500000000021 | 46.69 | 7.359 | 1.16 | 0.029 | 0.183 |
| 6.347500000000211 | 46.77 | 7.368 | 1.161 | 0.029 | 0.183 |
| 6.350000000000211 | 46.851 | 7.378 | 1.162 | 0.029 | 0.183 |
| 6.352500000000211 | 46.931 | 7.388 | 1.163 | 0.029 | 0.183 |
| 6.355000000000212 | 47.011 | 7.398 | 1.164 | 0.029 | 0.183 |
| 6.357500000000212 | 47.092 | 7.407 | 1.165 | 0.029 | 0.183 |
| 6.360000000000213 | 47.172 | 7.417 | 1.166 | 0.029 | 0.183 |
| 6.362500000000213 | 47.252 | 7.427 | 1.167 | 0.029 | 0.183 |
| 6.365000000000213 | 47.333 | 7.436 | 1.168 | 0.029 | 0.184 |
| 6.367500000000214 | 47.413 | 7.446 | 1.169 | 0.029 | 0.184 |
| 6.370000000000214 | 47.494 | 7.456 | 1.17 | 0.029 | 0.184 |
| 6.372500000000214 | 47.575 | 7.466 | 1.172 | 0.029 | 0.184 |
| 6.375000000000215 | 47.655 | 7.475 | 1.173 | 0.029 | 0.184 |
| 6.377500000000215 | 47.736 | 7.485 | 1.174 | 0.029 | 0.184 |
| 6.380000000000216 | 47.817 | 7.495 | 1.175 | 0.029 | 0.184 |
| 6.382500000000216 | 47.898 | 7.505 | 1.176 | 0.029 | 0.184 |
| 6.385000000000216 | 47.979 | 7.514 | 1.177 | 0.029 | 0.184 |
| 6.387500000000217 | 48.059 | 7.524 | 1.178 | 0.029 | 0.184 |
| 6.390000000000217 | 48.14 | 7.534 | 1.179 | 0.029 | 0.185 |
| 6.392500000000218 | 48.221 | 7.543 | 1.18 | 0.029 | 0.185 |
| 6.395000000000218 | 48.302 | 7.553 | 1.181 | 0.029 | 0.185 |
| 6.397500000000218 | 48.383 | 7.563 | 1.182 | 0.029 | 0.185 |
| 6.400000000000219 | 48.465 | 7.573 | 1.183 | 0.029 | 0.185 |
| 6.402500000000219 | 48.546 | 7.582 | 1.184 | 0.029 | 0.185 |
| 6.40500000000022 | 48.627 | 7.592 | 1.185 | 0.029 | 0.185 |
| 6.40750000000022 | 48.708 | 7.602 | 1.186 | 0.029 | 0.185 |
| 6.41000000000022 | 48.789 | 7.611 | 1.187 | 0.029 | 0.185 |
| 6.412500000000221 | 48.871 | 7.621 | 1.188 | 0.029 | 0.185 |
| 6.415000000000221 | 48.952 | 7.631 | 1.19 | 0.029 | 0.185 |
| 6.417500000000222 | 49.034 | 7.641 | 1.191 | 0.029 | 0.186 |
| 6.420000000000222 | 49.115 | 7.65 | 1.192 | 0.029 | 0.186 |
| 6.422500000000222 | 49.197 | 7.66 | 1.193 | 0.029 | 0.186 |
| 6.425000000000223 | 49.278 | 7.67 | 1.194 | 0.029 | 0.186 |
| 6.427500000000223 | 49.36 | 7.679 | 1.195 | 0.029 | 0.186 |
| 6.430000000000223 | 49.441 | 7.689 | 1.196 | 0.029 | 0.186 |
| 6.432500000000224 | 49.523 | 7.699 | 1.197 | 0.029 | 0.186 |
| 6.435000000000224 | 49.605 | 7.709 | 1.198 | 0.029 | 0.186 |
| 6.437500000000224 | 49.687 | 7.718 | 1.199 | 0.029 | 0.186 |
| 6.440000000000225 | 49.768 | 7.728 | 1.2 | 0.029 | 0.186 |
| 6.442500000000225 | 49.85 | 7.738 | 1.201 | 0.029 | 0.186 |
| 6.445000000000225 | 49.932 | 7.747 | 1.202 | 0.029 | 0.187 |
| 6.447500000000226 | 50.014 | 7.757 | 1.203 | 0.029 | 0.187 |
| 6.450000000000226 | 50.096 | 7.767 | 1.204 | 0.029 | 0.187 |
| 6.452500000000227 | 50.178 | 7.777 | 1.205 | 0.029 | 0.187 |
| 6.455000000000227 | 50.26 | 7.786 | 1.206 | 0.029 | 0.187 |
| 6.457500000000228 | 50.342 | 7.796 | 1.207 | 0.029 | 0.187 |
| 6.460000000000228 | 50.424 | 7.806 | 1.208 | 0.029 | 0.187 |
| 6.462500000000229 | 50.507 | 7.815 | 1.209 | 0.029 | 0.187 |
| 6.465000000000229 | 50.589 | 7.825 | 1.21 | 0.029 | 0.187 |
| 6.467500000000229 | 50.671 | 7.835 | 1.211 | 0.029 | 0.187 |
| 6.47000000000023 | 50.754 | 7.844 | 1.212 | 0.029 | 0.187 |
| 6.47250000000023 | 50.836 | 7.854 | 1.213 | 0.029 | 0.187 |
| 6.47500000000023 | 50.918 | 7.864 | 1.214 | 0.029 | 0.188 |
| 6.477500000000231 | 51.001 | 7.874 | 1.216 | 0.029 | 0.188 |
| 6.480000000000231 | 51.084 | 7.883 | 1.217 | 0.029 | 0.188 |
| 6.482500000000232 | 51.166 | 7.893 | 1.218 | 0.029 | 0.188 |
| 6.485000000000232 | 51.249 | 7.903 | 1.219 | 0.029 | 0.188 |
| 6.487500000000232 | 51.331 | 7.912 | 1.22 | 0.029 | 0.188 |
| 6.490000000000233 | 51.414 | 7.922 | 1.221 | 0.029 | 0.188 |
| 6.492500000000233 | 51.497 | 7.932 | 1.222 | 0.029 | 0.188 |
| 6.495000000000234 | 51.58 | 7.941 | 1.223 | 0.029 | 0.188 |
| 6.497500000000234 | 51.663 | 7.951 | 1.224 | 0.029 | 0.188 |
| 6.500000000000234 | 51.745 | 7.961 | 1.225 | 0.029 | 0.188 |
| 6.502500000000235 | 51.828 | 7.971 | 1.226 | 0.029 | 0.189 |
| 6.505000000000235 | 51.911 | 7.98 | 1.227 | 0.029 | 0.189 |
| 6.507500000000236 | 51.994 | 7.99 | 1.228 | 0.029 | 0.189 |
| 6.510000000000236 | 52.078 | 8 | 1.229 | 0.029 | 0.189 |
| 6.512500000000236 | 52.161 | 8.009 | 1.23 | 0.029 | 0.189 |
| 6.515000000000237 | 52.244 | 8.019 | 1.231 | 0.029 | 0.189 |
| 6.517500000000237 | 52.327 | 8.029 | 1.232 | 0.029 | 0.189 |
| 6.520000000000238 | 52.41 | 8.038 | 1.233 | 0.029 | 0.189 |
| 6.522500000000238 | 52.494 | 8.048 | 1.234 | 0.029 | 0.189 |
| 6.525000000000238 | 52.577 | 8.058 | 1.235 | 0.029 | 0.189 |
| 6.527500000000239 | 52.66 | 8.067 | 1.236 | 0.029 | 0.189 |
| 6.53000000000024 | 52.744 | 8.077 | 1.237 | 0.029 | 0.189 |
| 6.53250000000024 | 52.827 | 8.087 | 1.238 | 0.029 | 0.19 |
| 6.53500000000024 | 52.911 | 8.097 | 1.239 | 0.029 | 0.19 |
| 6.53750000000024 | 52.995 | 8.106 | 1.24 | 0.029 | 0.19 |
| 6.540000000000241 | 53.078 | 8.116 | 1.241 | 0.029 | 0.19 |
| 6.542500000000241 | 53.162 | 8.126 | 1.242 | 0.029 | 0.19 |
| 6.545000000000242 | 53.246 | 8.135 | 1.243 | 0.029 | 0.19 |
| 6.547500000000242 | 53.329 | 8.145 | 1.244 | 0.029 | 0.19 |
| 6.550000000000242 | 53.413 | 8.155 | 1.245 | 0.029 | 0.19 |
| 6.552500000000243 | 53.497 | 8.164 | 1.246 | 0.029 | 0.19 |
| 6.555000000000243 | 53.581 | 8.174 | 1.247 | 0.029 | 0.19 |
| 6.557500000000243 | 53.665 | 8.184 | 1.248 | 0.029 | 0.19 |
| 6.560000000000244 | 53.749 | 8.193 | 1.249 | 0.029 | 0.19 |
| 6.562500000000244 | 53.833 | 8.203 | 1.25 | 0.029 | 0.19 |
| 6.565000000000245 | 53.917 | 8.213 | 1.251 | 0.029 | 0.191 |
| 6.567500000000245 | 54.001 | 8.222 | 1.252 | 0.029 | 0.191 |
| 6.570000000000245 | 54.085 | 8.232 | 1.253 | 0.029 | 0.191 |
| 6.572500000000246 | 54.17 | 8.242 | 1.254 | 0.029 | 0.191 |
| 6.575000000000246 | 54.254 | 8.252 | 1.255 | 0.029 | 0.191 |
| 6.577500000000247 | 54.338 | 8.261 | 1.256 | 0.029 | 0.191 |
| 6.580000000000247 | 54.423 | 8.271 | 1.257 | 0.029 | 0.191 |
| 6.582500000000247 | 54.507 | 8.281 | 1.258 | 0.029 | 0.191 |
| 6.585000000000248 | 54.592 | 8.29 | 1.259 | 0.029 | 0.191 |
| 6.587500000000248 | 54.676 | 8.3 | 1.26 | 0.029 | 0.191 |
| 6.590000000000249 | 54.761 | 8.31 | 1.261 | 0.029 | 0.191 |
| 6.592500000000249 | 54.845 | 8.319 | 1.262 | 0.029 | 0.191 |
| 6.595000000000249 | 54.93 | 8.329 | 1.263 | 0.029 | 0.191 |
| 6.59750000000025 | 55.015 | 8.339 | 1.264 | 0.029 | 0.192 |
| 6.60000000000025 | 55.1 | 8.348 | 1.265 | 0.029 | 0.192 |
| 6.60250000000025 | 55.184 | 8.358 | 1.266 | 0.029 | 0.192 |
| 6.605000000000251 | 55.269 | 8.368 | 1.267 | 0.029 | 0.192 |
| 6.607500000000251 | 55.354 | 8.377 | 1.268 | 0.029 | 0.192 |
| 6.610000000000252 | 55.439 | 8.387 | 1.269 | 0.029 | 0.192 |
| 6.612500000000252 | 55.524 | 8.397 | 1.27 | 0.029 | 0.192 |
| 6.615000000000252 | 55.609 | 8.407 | 1.271 | 0.029 | 0.192 |
| 6.617500000000253 | 55.694 | 8.416 | 1.272 | 0.029 | 0.192 |
| 6.620000000000253 | 55.779 | 8.426 | 1.273 | 0.029 | 0.192 |
| 6.622500000000254 | 55.865 | 8.436 | 1.274 | 0.029 | 0.192 |
| 6.625000000000254 | 55.95 | 8.445 | 1.275 | 0.029 | 0.192 |
| 6.627500000000254 | 56.035 | 8.455 | 1.276 | 0.029 | 0.192 |
| 6.630000000000255 | 56.12 | 8.465 | 1.277 | 0.029 | 0.193 |
| 6.632500000000255 | 56.206 | 8.474 | 1.278 | 0.029 | 0.193 |
| 6.635000000000255 | 56.291 | 8.484 | 1.279 | 0.029 | 0.193 |
| 6.637500000000256 | 56.377 | 8.494 | 1.28 | 0.029 | 0.193 |
| 6.640000000000256 | 56.462 | 8.503 | 1.281 | 0.029 | 0.193 |
| 6.642500000000257 | 56.548 | 8.513 | 1.282 | 0.029 | 0.193 |
| 6.645000000000257 | 56.633 | 8.523 | 1.283 | 0.029 | 0.193 |
| 6.647500000000257 | 56.719 | 8.532 | 1.284 | 0.029 | 0.193 |
| 6.650000000000258 | 56.805 | 8.542 | 1.285 | 0.029 | 0.193 |
| 6.652500000000258 | 56.891 | 8.552 | 1.285 | 0.029 | 0.193 |
| 6.655000000000259 | 56.976 | 8.561 | 1.286 | 0.029 | 0.193 |
| 6.657500000000259 | 57.062 | 8.571 | 1.287 | 0.029 | 0.193 |
| 6.660000000000259 | 57.148 | 8.581 | 1.288 | 0.029 | 0.193 |
| 6.66250000000026 | 57.234 | 8.59 | 1.289 | 0.029 | 0.194 |
| 6.66500000000026 | 57.32 | 8.6 | 1.29 | 0.029 | 0.194 |
| 6.667500000000261 | 57.406 | 8.61 | 1.291 | 0.029 | 0.194 |
| 6.670000000000261 | 57.492 | 8.62 | 1.292 | 0.029 | 0.194 |
| 6.672500000000261 | 57.578 | 8.629 | 1.293 | 0.029 | 0.194 |
| 6.675000000000262 | 57.665 | 8.639 | 1.294 | 0.029 | 0.194 |
| 6.677500000000262 | 57.751 | 8.649 | 1.295 | 0.029 | 0.194 |
| 6.680000000000263 | 57.837 | 8.658 | 1.296 | 0.029 | 0.194 |
| 6.682500000000263 | 57.924 | 8.668 | 1.297 | 0.029 | 0.194 |
| 6.685000000000263 | 58.01 | 8.678 | 1.298 | 0.029 | 0.194 |
| 6.687500000000264 | 58.096 | 8.687 | 1.299 | 0.029 | 0.194 |
| 6.690000000000264 | 58.183 | 8.697 | 1.3 | 0.029 | 0.194 |
| 6.692500000000264 | 58.269 | 8.707 | 1.301 | 0.029 | 0.194 |
| 6.695000000000265 | 58.356 | 8.716 | 1.302 | 0.029 | 0.194 |
| 6.697500000000265 | 58.443 | 8.726 | 1.303 | 0.029 | 0.195 |
| 6.700000000000265 | 58.529 | 8.736 | 1.304 | 0.029 | 0.195 |
| 6.702500000000266 | 58.616 | 8.745 | 1.305 | 0.029 | 0.195 |
| 6.705000000000266 | 58.703 | 8.755 | 1.306 | 0.029 | 0.195 |
| 6.707500000000267 | 58.79 | 8.765 | 1.307 | 0.029 | 0.195 |
| 6.710000000000267 | 58.877 | 8.774 | 1.308 | 0.029 | 0.195 |
| 6.712500000000268 | 58.964 | 8.784 | 1.309 | 0.029 | 0.195 |
| 6.715000000000268 | 59.051 | 8.794 | 1.31 | 0.029 | 0.195 |
| 6.717500000000268 | 59.138 | 8.804 | 1.311 | 0.029 | 0.195 |
| 6.720000000000269 | 59.225 | 8.813 | 1.311 | 0.029 | 0.195 |
| 6.722500000000269 | 59.312 | 8.823 | 1.312 | 0.029 | 0.195 |
| 6.72500000000027 | 59.399 | 8.833 | 1.313 | 0.029 | 0.195 |
| 6.72750000000027 | 59.486 | 8.842 | 1.314 | 0.029 | 0.195 |
| 6.73000000000027 | 59.574 | 8.852 | 1.315 | 0.029 | 0.195 |
| 6.732500000000271 | 59.661 | 8.862 | 1.316 | 0.029 | 0.196 |
| 6.735000000000271 | 59.748 | 8.871 | 1.317 | 0.029 | 0.196 |
| 6.737500000000272 | 59.836 | 8.881 | 1.318 | 0.029 | 0.196 |
| 6.740000000000272 | 59.923 | 8.891 | 1.319 | 0.029 | 0.196 |
| 6.742500000000272 | 60.011 | 8.9 | 1.32 | 0.029 | 0.196 |
| 6.745000000000273 | 60.098 | 8.91 | 1.321 | 0.029 | 0.196 |
| 6.747500000000273 | 60.186 | 8.92 | 1.322 | 0.029 | 0.196 |
| 6.750000000000273 | 60.274 | 8.929 | 1.323 | 0.029 | 0.196 |
| 6.752500000000274 | 60.361 | 8.939 | 1.324 | 0.029 | 0.196 |
| 6.755000000000274 | 60.449 | 8.949 | 1.325 | 0.029 | 0.196 |
| 6.757500000000275 | 60.537 | 8.958 | 1.326 | 0.029 | 0.196 |
| 6.760000000000275 | 60.625 | 8.968 | 1.327 | 0.029 | 0.196 |
| 6.762500000000275 | 60.713 | 8.978 | 1.328 | 0.029 | 0.196 |
| 6.765000000000276 | 60.801 | 8.988 | 1.329 | 0.029 | 0.196 |
| 6.767500000000276 | 60.889 | 8.997 | 1.329 | 0.029 | 0.196 |
| 6.770000000000276 | 60.977 | 9.007 | 1.33 | 0.029 | 0.197 |
| 6.772500000000277 | 61.065 | 9.017 | 1.331 | 0.029 | 0.197 |
| 6.775000000000277 | 61.153 | 9.026 | 1.332 | 0.029 | 0.197 |
| 6.777500000000278 | 61.241 | 9.036 | 1.333 | 0.029 | 0.197 |
| 6.780000000000278 | 61.329 | 9.046 | 1.334 | 0.029 | 0.197 |
| 6.782500000000279 | 61.418 | 9.055 | 1.335 | 0.029 | 0.197 |
| 6.785000000000279 | 61.506 | 9.065 | 1.336 | 0.029 | 0.197 |
| 6.787500000000279 | 61.595 | 9.075 | 1.337 | 0.029 | 0.197 |
| 6.79000000000028 | 61.683 | 9.084 | 1.338 | 0.029 | 0.197 |
| 6.79250000000028 | 61.772 | 9.094 | 1.339 | 0.029 | 0.197 |
| 6.795000000000281 | 61.86 | 9.104 | 1.34 | 0.029 | 0.197 |
| 6.797500000000281 | 61.949 | 9.113 | 1.341 | 0.029 | 0.197 |
| 6.800000000000281 | 62.037 | 9.123 | 1.342 | 0.029 | 0.197 |
| 6.802500000000282 | 62.126 | 9.133 | 1.343 | 0.029 | 0.197 |
| 6.805000000000282 | 62.215 | 9.143 | 1.344 | 0.029 | 0.197 |
| 6.807500000000283 | 62.304 | 9.152 | 1.344 | 0.029 | 0.197 |
| 6.810000000000283 | 62.393 | 9.162 | 1.345 | 0.029 | 0.198 |
| 6.812500000000283 | 62.482 | 9.172 | 1.346 | 0.029 | 0.198 |
| 6.815000000000284 | 62.571 | 9.181 | 1.347 | 0.029 | 0.198 |
| 6.817500000000284 | 62.66 | 9.191 | 1.348 | 0.029 | 0.198 |
| 6.820000000000284 | 62.749 | 9.201 | 1.349 | 0.029 | 0.198 |
| 6.822500000000285 | 62.838 | 9.21 | 1.35 | 0.029 | 0.198 |
| 6.825000000000285 | 62.927 | 9.22 | 1.351 | 0.029 | 0.198 |
| 6.827500000000286 | 63.016 | 9.23 | 1.352 | 0.029 | 0.198 |
| 6.830000000000286 | 63.105 | 9.239 | 1.353 | 0.029 | 0.198 |
| 6.832500000000286 | 63.195 | 9.249 | 1.354 | 0.029 | 0.198 |
| 6.835000000000287 | 63.284 | 9.259 | 1.355 | 0.029 | 0.198 |
| 6.837500000000287 | 63.374 | 9.269 | 1.356 | 0.029 | 0.198 |
| 6.840000000000288 | 63.463 | 9.278 | 1.356 | 0.029 | 0.198 |
| 6.842500000000288 | 63.553 | 9.288 | 1.357 | 0.029 | 0.198 |
| 6.845000000000288 | 63.642 | 9.298 | 1.358 | 0.029 | 0.198 |
| 6.847500000000289 | 63.732 | 9.307 | 1.359 | 0.029 | 0.198 |
| 6.850000000000289 | 63.821 | 9.317 | 1.36 | 0.029 | 0.199 |
| 6.85250000000029 | 63.911 | 9.327 | 1.361 | 0.029 | 0.199 |
| 6.85500000000029 | 64.001 | 9.336 | 1.362 | 0.029 | 0.199 |
| 6.85750000000029 | 64.091 | 9.346 | 1.363 | 0.029 | 0.199 |
| 6.860000000000291 | 64.181 | 9.356 | 1.364 | 0.029 | 0.199 |
| 6.862500000000291 | 64.271 | 9.365 | 1.365 | 0.029 | 0.199 |
| 6.865000000000291 | 64.361 | 9.375 | 1.366 | 0.029 | 0.199 |
| 6.867500000000292 | 64.451 | 9.385 | 1.367 | 0.029 | 0.199 |
| 6.870000000000292 | 64.541 | 9.395 | 1.367 | 0.029 | 0.199 |
| 6.872500000000293 | 64.631 | 9.404 | 1.368 | 0.029 | 0.199 |
| 6.875000000000293 | 64.721 | 9.414 | 1.369 | 0.029 | 0.199 |
| 6.877500000000293 | 64.811 | 9.424 | 1.37 | 0.029 | 0.199 |
| 6.880000000000294 | 64.902 | 9.433 | 1.371 | 0.029 | 0.199 |
| 6.882500000000294 | 64.992 | 9.443 | 1.372 | 0.029 | 0.199 |
| 6.885000000000295 | 65.082 | 9.453 | 1.373 | 0.029 | 0.199 |
| 6.887500000000295 | 65.173 | 9.462 | 1.374 | 0.029 | 0.199 |
| 6.890000000000295 | 65.263 | 9.472 | 1.375 | 0.029 | 0.2 |
| 6.892500000000296 | 65.354 | 9.482 | 1.376 | 0.029 | 0.2 |
| 6.895000000000296 | 65.444 | 9.492 | 1.377 | 0.029 | 0.2 |
| 6.897500000000297 | 65.535 | 9.501 | 1.377 | 0.029 | 0.2 |
| 6.900000000000297 | 65.626 | 9.511 | 1.378 | 0.029 | 0.2 |
| 6.902500000000297 | 65.717 | 9.521 | 1.379 | 0.029 | 0.2 |
| 6.905000000000298 | 65.807 | 9.53 | 1.38 | 0.029 | 0.2 |
| 6.907500000000298 | 65.898 | 9.54 | 1.381 | 0.029 | 0.2 |
| 6.910000000000299 | 65.989 | 9.55 | 1.382 | 0.029 | 0.2 |
| 6.912500000000299 | 66.08 | 9.56 | 1.383 | 0.029 | 0.2 |
| 6.915000000000299 | 66.171 | 9.569 | 1.384 | 0.029 | 0.2 |
| 6.9175000000003 | 66.262 | 9.579 | 1.385 | 0.029 | 0.2 |
| 6.9200000000003 | 66.353 | 9.589 | 1.386 | 0.029 | 0.2 |
| 6.9225000000003 | 66.445 | 9.598 | 1.387 | 0.029 | 0.2 |
| 6.925000000000301 | 66.536 | 9.608 | 1.387 | 0.029 | 0.2 |
| 6.927500000000301 | 66.627 | 9.618 | 1.388 | 0.029 | 0.2 |
| 6.930000000000301 | 66.718 | 9.627 | 1.389 | 0.029 | 0.2 |
| 6.932500000000302 | 66.81 | 9.637 | 1.39 | 0.029 | 0.201 |
| 6.935000000000302 | 66.901 | 9.647 | 1.391 | 0.029 | 0.201 |
| 6.937500000000303 | 66.993 | 9.657 | 1.392 | 0.029 | 0.201 |
| 6.940000000000303 | 67.084 | 9.666 | 1.393 | 0.029 | 0.201 |
| 6.942500000000304 | 67.176 | 9.676 | 1.394 | 0.029 | 0.201 |
| 6.945000000000304 | 67.267 | 9.686 | 1.395 | 0.029 | 0.201 |
| 6.947500000000304 | 67.359 | 9.695 | 1.396 | 0.029 | 0.201 |
| 6.950000000000304 | 67.451 | 9.705 | 1.396 | 0.029 | 0.201 |
| 6.952500000000305 | 67.543 | 9.715 | 1.397 | 0.029 | 0.201 |
| 6.955000000000305 | 67.634 | 9.725 | 1.398 | 0.029 | 0.201 |
| 6.957500000000306 | 67.726 | 9.734 | 1.399 | 0.029 | 0.201 |
| 6.960000000000306 | 67.818 | 9.744 | 1.4 | 0.029 | 0.201 |
| 6.962500000000307 | 67.91 | 9.754 | 1.401 | 0.029 | 0.201 |
| 6.965000000000307 | 68.002 | 9.763 | 1.402 | 0.029 | 0.201 |
| 6.967500000000308 | 68.094 | 9.773 | 1.403 | 0.029 | 0.201 |
| 6.970000000000307 | 68.187 | 9.783 | 1.404 | 0.029 | 0.201 |
| 6.972500000000308 | 68.279 | 9.793 | 1.404 | 0.029 | 0.201 |
| 6.975000000000308 | 68.371 | 9.802 | 1.405 | 0.029 | 0.201 |
| 6.97750000000031 | 68.463 | 9.812 | 1.406 | 0.029 | 0.202 |
| 6.98000000000031 | 68.556 | 9.822 | 1.407 | 0.029 | 0.202 |
| 6.98250000000031 | 68.648 | 9.831 | 1.408 | 0.029 | 0.202 |
| 6.98500000000031 | 68.741 | 9.841 | 1.409 | 0.029 | 0.202 |
| 6.987500000000311 | 68.833 | 9.851 | 1.41 | 0.029 | 0.202 |
| 6.990000000000311 | 68.926 | 9.861 | 1.411 | 0.029 | 0.202 |
| 6.992500000000311 | 69.018 | 9.87 | 1.412 | 0.029 | 0.202 |
| 6.995000000000312 | 69.111 | 9.88 | 1.412 | 0.029 | 0.202 |
| 6.997500000000312 | 69.204 | 9.89 | 1.413 | 0.029 | 0.202 |
| 7.000000000000313 | 69.296 | 9.899 | 1.414 | 0.029 | 0.202 |
| 7.002500000000313 | 69.389 | 9.909 | 1.415 | 0.029 | 0.202 |
| 7.005000000000313 | 69.482 | 9.919 | 1.416 | 0.029 | 0.202 |
| 7.007500000000314 | 69.575 | 9.929 | 1.417 | 0.029 | 0.202 |
| 7.010000000000314 | 69.668 | 9.938 | 1.418 | 0.029 | 0.202 |
| 7.012500000000315 | 69.761 | 9.948 | 1.419 | 0.029 | 0.202 |
| 7.015000000000315 | 69.854 | 9.958 | 1.42 | 0.029 | 0.202 |
| 7.017500000000315 | 69.947 | 9.968 | 1.42 | 0.029 | 0.202 |
| 7.020000000000316 | 70.041 | 9.977 | 1.421 | 0.029 | 0.202 |
| 7.022500000000316 | 70.134 | 9.987 | 1.422 | 0.029 | 0.203 |
| 7.025000000000317 | 70.227 | 9.997 | 1.423 | 0.029 | 0.203 |
| 7.027500000000317 | 70.321 | 10.006 | 1.424 | 0.029 | 0.203 |
| 7.030000000000317 | 70.414 | 10.016 | 1.425 | 0.029 | 0.203 |
| 7.032500000000318 | 70.507 | 10.026 | 1.426 | 0.029 | 0.203 |
| 7.035000000000318 | 70.601 | 10.036 | 1.427 | 0.029 | 0.203 |
| 7.037500000000318 | 70.694 | 10.045 | 1.427 | 0.029 | 0.203 |
| 7.040000000000319 | 70.788 | 10.055 | 1.428 | 0.029 | 0.203 |
| 7.042500000000319 | 70.882 | 10.065 | 1.429 | 0.029 | 0.203 |
| 7.04500000000032 | 70.976 | 10.075 | 1.43 | 0.029 | 0.203 |
| 7.04750000000032 | 71.069 | 10.084 | 1.431 | 0.029 | 0.203 |
| 7.05000000000032 | 71.163 | 10.094 | 1.432 | 0.029 | 0.203 |
| 7.052500000000321 | 71.257 | 10.104 | 1.433 | 0.029 | 0.203 |
| 7.055000000000321 | 71.351 | 10.114 | 1.434 | 0.029 | 0.203 |
| 7.057500000000322 | 71.445 | 10.123 | 1.434 | 0.029 | 0.203 |
| 7.060000000000322 | 71.539 | 10.133 | 1.435 | 0.029 | 0.203 |
| 7.062500000000322 | 71.633 | 10.143 | 1.436 | 0.029 | 0.203 |
| 7.065000000000323 | 71.727 | 10.152 | 1.437 | 0.029 | 0.203 |
| 7.067500000000323 | 71.821 | 10.162 | 1.438 | 0.029 | 0.203 |
| 7.070000000000323 | 71.916 | 10.172 | 1.439 | 0.029 | 0.204 |
| 7.072500000000324 | 72.01 | 10.182 | 1.44 | 0.029 | 0.204 |
| 7.075000000000324 | 72.104 | 10.191 | 1.44 | 0.029 | 0.204 |
| 7.077500000000324 | 72.199 | 10.201 | 1.441 | 0.029 | 0.204 |
| 7.080000000000325 | 72.293 | 10.211 | 1.442 | 0.029 | 0.204 |
| 7.082500000000325 | 72.388 | 10.221 | 1.443 | 0.029 | 0.204 |
| 7.085000000000325 | 72.482 | 10.23 | 1.444 | 0.029 | 0.204 |
| 7.087500000000326 | 72.577 | 10.24 | 1.445 | 0.029 | 0.204 |
| 7.090000000000326 | 72.672 | 10.25 | 1.446 | 0.029 | 0.204 |
| 7.092500000000327 | 72.766 | 10.26 | 1.447 | 0.029 | 0.204 |
| 7.095000000000327 | 72.861 | 10.269 | 1.447 | 0.029 | 0.204 |
| 7.097500000000328 | 72.956 | 10.279 | 1.448 | 0.029 | 0.204 |
| 7.100000000000328 | 73.051 | 10.289 | 1.449 | 0.029 | 0.204 |
| 7.102500000000329 | 73.146 | 10.299 | 1.45 | 0.029 | 0.204 |
| 7.10500000000033 | 73.241 | 10.308 | 1.451 | 0.029 | 0.204 |
| 7.107500000000329 | 73.336 | 10.318 | 1.452 | 0.029 | 0.204 |
| 7.11000000000033 | 73.431 | 10.328 | 1.453 | 0.029 | 0.204 |
| 7.11250000000033 | 73.526 | 10.338 | 1.453 | 0.029 | 0.204 |
| 7.115000000000331 | 73.622 | 10.347 | 1.454 | 0.029 | 0.204 |
| 7.117500000000331 | 73.717 | 10.357 | 1.455 | 0.029 | 0.204 |
| 7.120000000000331 | 73.812 | 10.367 | 1.456 | 0.029 | 0.204 |
| 7.122500000000332 | 73.908 | 10.377 | 1.457 | 0.029 | 0.205 |
| 7.125000000000332 | 74.003 | 10.386 | 1.458 | 0.029 | 0.205 |
| 7.127500000000333 | 74.098 | 10.396 | 1.459 | 0.029 | 0.205 |
| 7.130000000000333 | 74.194 | 10.406 | 1.459 | 0.029 | 0.205 |
| 7.132500000000333 | 74.29 | 10.416 | 1.46 | 0.029 | 0.205 |
| 7.135000000000334 | 74.385 | 10.425 | 1.461 | 0.029 | 0.205 |
| 7.137500000000334 | 74.481 | 10.435 | 1.462 | 0.029 | 0.205 |
| 7.140000000000334 | 74.577 | 10.445 | 1.463 | 0.029 | 0.205 |
| 7.142500000000335 | 74.673 | 10.455 | 1.464 | 0.029 | 0.205 |
| 7.145000000000335 | 74.768 | 10.464 | 1.465 | 0.029 | 0.205 |
| 7.147500000000336 | 74.864 | 10.474 | 1.465 | 0.029 | 0.205 |
| 7.150000000000336 | 74.96 | 10.484 | 1.466 | 0.029 | 0.205 |
| 7.152500000000336 | 75.056 | 10.494 | 1.467 | 0.029 | 0.205 |
| 7.155000000000337 | 75.152 | 10.503 | 1.468 | 0.029 | 0.205 |
| 7.157500000000337 | 75.249 | 10.513 | 1.469 | 0.029 | 0.205 |
| 7.160000000000338 | 75.345 | 10.523 | 1.47 | 0.029 | 0.205 |
| 7.162500000000338 | 75.441 | 10.533 | 1.471 | 0.029 | 0.205 |
| 7.165000000000338 | 75.537 | 10.543 | 1.471 | 0.029 | 0.205 |
| 7.167500000000339 | 75.634 | 10.552 | 1.472 | 0.029 | 0.205 |
| 7.17000000000034 | 75.73 | 10.562 | 1.473 | 0.029 | 0.205 |
| 7.17250000000034 | 75.826 | 10.572 | 1.474 | 0.029 | 0.205 |
| 7.17500000000034 | 75.923 | 10.582 | 1.475 | 0.029 | 0.206 |
| 7.17750000000034 | 76.02 | 10.591 | 1.476 | 0.029 | 0.206 |
| 7.180000000000341 | 76.116 | 10.601 | 1.476 | 0.029 | 0.206 |
| 7.182500000000341 | 76.213 | 10.611 | 1.477 | 0.029 | 0.206 |
| 7.185000000000342 | 76.31 | 10.621 | 1.478 | 0.029 | 0.206 |
| 7.187500000000342 | 76.406 | 10.63 | 1.479 | 0.029 | 0.206 |
| 7.190000000000342 | 76.503 | 10.64 | 1.48 | 0.029 | 0.206 |
| 7.192500000000343 | 76.6 | 10.65 | 1.481 | 0.029 | 0.206 |
| 7.195000000000343 | 76.697 | 10.66 | 1.482 | 0.029 | 0.206 |
| 7.197500000000343 | 76.794 | 10.67 | 1.482 | 0.029 | 0.206 |
| 7.200000000000344 | 76.891 | 10.679 | 1.483 | 0.029 | 0.206 |
| 7.202500000000344 | 76.988 | 10.689 | 1.484 | 0.029 | 0.206 |
| 7.205000000000344 | 77.085 | 10.699 | 1.485 | 0.029 | 0.206 |
| 7.207500000000345 | 77.183 | 10.709 | 1.486 | 0.029 | 0.206 |
| 7.210000000000345 | 77.28 | 10.718 | 1.487 | 0.029 | 0.206 |
| 7.212500000000346 | 77.377 | 10.728 | 1.487 | 0.029 | 0.206 |
| 7.215000000000346 | 77.475 | 10.738 | 1.488 | 0.029 | 0.206 |
| 7.217500000000347 | 77.572 | 10.748 | 1.489 | 0.029 | 0.206 |
| 7.220000000000347 | 77.67 | 10.758 | 1.49 | 0.029 | 0.206 |
| 7.222500000000347 | 77.767 | 10.767 | 1.491 | 0.029 | 0.206 |
| 7.225000000000348 | 77.865 | 10.777 | 1.492 | 0.029 | 0.206 |
| 7.227500000000348 | 77.962 | 10.787 | 1.492 | 0.029 | 0.207 |
| 7.230000000000348 | 78.06 | 10.797 | 1.493 | 0.029 | 0.207 |
| 7.232500000000349 | 78.158 | 10.806 | 1.494 | 0.029 | 0.207 |
| 7.23500000000035 | 78.256 | 10.816 | 1.495 | 0.029 | 0.207 |
| 7.23750000000035 | 78.354 | 10.826 | 1.496 | 0.029 | 0.207 |
| 7.24000000000035 | 78.451 | 10.836 | 1.497 | 0.029 | 0.207 |
| 7.242500000000351 | 78.549 | 10.846 | 1.497 | 0.029 | 0.207 |
| 7.245000000000351 | 78.648 | 10.855 | 1.498 | 0.029 | 0.207 |
| 7.247500000000351 | 78.746 | 10.865 | 1.499 | 0.029 | 0.207 |
| 7.250000000000352 | 78.844 | 10.875 | 1.5 | 0.029 | 0.207 |
| 7.252500000000352 | 78.942 | 10.885 | 1.501 | 0.029 | 0.207 |
| 7.255000000000352 | 79.04 | 10.895 | 1.502 | 0.029 | 0.207 |
| 7.257500000000353 | 79.139 | 10.904 | 1.502 | 0.029 | 0.207 |
| 7.260000000000353 | 79.237 | 10.914 | 1.503 | 0.029 | 0.207 |
| 7.262500000000354 | 79.335 | 10.924 | 1.504 | 0.029 | 0.207 |
| 7.265000000000354 | 79.434 | 10.934 | 1.505 | 0.029 | 0.207 |
| 7.267500000000354 | 79.532 | 10.944 | 1.506 | 0.029 | 0.207 |
| 7.270000000000354 | 79.631 | 10.953 | 1.507 | 0.029 | 0.207 |
| 7.272500000000355 | 79.73 | 10.963 | 1.507 | 0.029 | 0.207 |
| 7.275000000000355 | 79.828 | 10.973 | 1.508 | 0.028 | 0.207 |
| 7.277500000000356 | 79.927 | 10.983 | 1.509 | 0.028 | 0.207 |
| 7.280000000000356 | 80.026 | 10.993 | 1.51 | 0.028 | 0.207 |
| 7.282500000000357 | 80.125 | 11.002 | 1.511 | 0.028 | 0.207 |
| 7.285000000000357 | 80.224 | 11.012 | 1.512 | 0.028 | 0.207 |
| 7.287500000000358 | 80.323 | 11.022 | 1.512 | 0.028 | 0.208 |
| 7.290000000000358 | 80.422 | 11.032 | 1.513 | 0.028 | 0.208 |
| 7.292500000000358 | 80.521 | 11.042 | 1.514 | 0.028 | 0.208 |
| 7.295000000000359 | 80.62 | 11.051 | 1.515 | 0.028 | 0.208 |
| 7.297500000000359 | 80.719 | 11.061 | 1.516 | 0.028 | 0.208 |
| 7.300000000000359 | 80.818 | 11.071 | 1.517 | 0.028 | 0.208 |
| 7.30250000000036 | 80.918 | 11.081 | 1.517 | 0.028 | 0.208 |
| 7.30500000000036 | 81.017 | 11.091 | 1.518 | 0.028 | 0.208 |
| 7.307500000000361 | 81.116 | 11.1 | 1.519 | 0.028 | 0.208 |
| 7.310000000000361 | 81.216 | 11.11 | 1.52 | 0.028 | 0.208 |
| 7.312500000000361 | 81.315 | 11.12 | 1.521 | 0.028 | 0.208 |
| 7.315000000000362 | 81.415 | 11.13 | 1.522 | 0.028 | 0.208 |
| 7.317500000000362 | 81.515 | 11.14 | 1.522 | 0.028 | 0.208 |
| 7.320000000000363 | 81.614 | 11.149 | 1.523 | 0.028 | 0.208 |
| 7.322500000000363 | 81.714 | 11.159 | 1.524 | 0.028 | 0.208 |
| 7.325000000000363 | 81.814 | 11.169 | 1.525 | 0.028 | 0.208 |
| 7.327500000000364 | 81.914 | 11.179 | 1.526 | 0.028 | 0.208 |
| 7.330000000000364 | 82.014 | 11.189 | 1.526 | 0.028 | 0.208 |
| 7.332500000000364 | 82.114 | 11.199 | 1.527 | 0.028 | 0.208 |
| 7.335000000000364 | 82.214 | 11.208 | 1.528 | 0.028 | 0.208 |
| 7.337500000000365 | 82.314 | 11.218 | 1.529 | 0.028 | 0.208 |
| 7.340000000000365 | 82.414 | 11.228 | 1.53 | 0.028 | 0.208 |
| 7.342500000000366 | 82.514 | 11.238 | 1.531 | 0.028 | 0.208 |
| 7.345000000000366 | 82.614 | 11.248 | 1.531 | 0.028 | 0.208 |
| 7.347500000000367 | 82.715 | 11.258 | 1.532 | 0.028 | 0.209 |
| 7.350000000000367 | 82.815 | 11.267 | 1.533 | 0.028 | 0.209 |
| 7.352500000000368 | 82.915 | 11.277 | 1.534 | 0.028 | 0.209 |
| 7.355000000000368 | 83.016 | 11.287 | 1.535 | 0.028 | 0.209 |
| 7.357500000000368 | 83.116 | 11.297 | 1.535 | 0.028 | 0.209 |
| 7.360000000000369 | 83.217 | 11.307 | 1.536 | 0.028 | 0.209 |
| 7.362500000000369 | 83.318 | 11.316 | 1.537 | 0.028 | 0.209 |
| 7.36500000000037 | 83.418 | 11.326 | 1.538 | 0.028 | 0.209 |
| 7.36750000000037 | 83.519 | 11.336 | 1.539 | 0.028 | 0.209 |
| 7.37000000000037 | 83.62 | 11.346 | 1.539 | 0.028 | 0.209 |
| 7.372500000000371 | 83.721 | 11.356 | 1.54 | 0.028 | 0.209 |
| 7.375000000000371 | 83.822 | 11.366 | 1.541 | 0.028 | 0.209 |
| 7.377500000000372 | 83.923 | 11.375 | 1.542 | 0.028 | 0.209 |
| 7.380000000000372 | 84.024 | 11.385 | 1.543 | 0.028 | 0.209 |
| 7.382500000000372 | 84.125 | 11.395 | 1.544 | 0.028 | 0.209 |
| 7.385000000000373 | 84.226 | 11.405 | 1.544 | 0.028 | 0.209 |
| 7.387500000000373 | 84.327 | 11.415 | 1.545 | 0.028 | 0.209 |
| 7.390000000000374 | 84.428 | 11.425 | 1.546 | 0.028 | 0.209 |
| 7.392500000000374 | 84.53 | 11.435 | 1.547 | 0.028 | 0.209 |
| 7.395000000000374 | 84.631 | 11.444 | 1.548 | 0.028 | 0.209 |
| 7.397500000000375 | 84.732 | 11.454 | 1.548 | 0.028 | 0.209 |
| 7.400000000000375 | 84.834 | 11.464 | 1.549 | 0.028 | 0.209 |
| 7.402500000000375 | 84.935 | 11.474 | 1.55 | 0.028 | 0.209 |
| 7.405000000000375 | 85.037 | 11.484 | 1.551 | 0.028 | 0.209 |
| 7.407500000000376 | 85.139 | 11.494 | 1.552 | 0.028 | 0.209 |
| 7.410000000000376 | 85.24 | 11.503 | 1.552 | 0.028 | 0.21 |
| 7.412500000000377 | 85.342 | 11.513 | 1.553 | 0.028 | 0.21 |
| 7.415000000000377 | 85.444 | 11.523 | 1.554 | 0.028 | 0.21 |
| 7.417500000000378 | 85.546 | 11.533 | 1.555 | 0.028 | 0.21 |
| 7.420000000000378 | 85.648 | 11.543 | 1.556 | 0.028 | 0.21 |
| 7.422500000000379 | 85.75 | 11.553 | 1.556 | 0.028 | 0.21 |
| 7.42500000000038 | 85.852 | 11.563 | 1.557 | 0.028 | 0.21 |
| 7.427500000000379 | 85.954 | 11.572 | 1.558 | 0.028 | 0.21 |
| 7.43000000000038 | 86.056 | 11.582 | 1.559 | 0.028 | 0.21 |
| 7.43250000000038 | 86.158 | 11.592 | 1.56 | 0.028 | 0.21 |
| 7.43500000000038 | 86.26 | 11.602 | 1.56 | 0.028 | 0.21 |
| 7.437500000000381 | 86.363 | 11.612 | 1.561 | 0.028 | 0.21 |
| 7.440000000000381 | 86.465 | 11.622 | 1.562 | 0.028 | 0.21 |
| 7.442500000000382 | 86.568 | 11.632 | 1.563 | 0.028 | 0.21 |
| 7.445000000000382 | 86.67 | 11.641 | 1.564 | 0.028 | 0.21 |
| 7.447500000000383 | 86.773 | 11.651 | 1.564 | 0.028 | 0.21 |
| 7.450000000000383 | 86.875 | 11.661 | 1.565 | 0.028 | 0.21 |
| 7.452500000000383 | 86.978 | 11.671 | 1.566 | 0.028 | 0.21 |
| 7.455000000000384 | 87.081 | 11.681 | 1.567 | 0.028 | 0.21 |
| 7.457500000000384 | 87.183 | 11.691 | 1.568 | 0.028 | 0.21 |
| 7.460000000000384 | 87.286 | 11.701 | 1.568 | 0.028 | 0.21 |
| 7.462500000000385 | 87.389 | 11.71 | 1.569 | 0.028 | 0.21 |
| 7.465000000000385 | 87.492 | 11.72 | 1.57 | 0.028 | 0.21 |
| 7.467500000000386 | 87.595 | 11.73 | 1.571 | 0.028 | 0.21 |
| 7.470000000000386 | 87.698 | 11.74 | 1.572 | 0.028 | 0.21 |
| 7.472500000000386 | 87.801 | 11.75 | 1.572 | 0.028 | 0.21 |
| 7.475000000000386 | 87.904 | 11.76 | 1.573 | 0.028 | 0.21 |
| 7.477500000000387 | 88.007 | 11.77 | 1.574 | 0.028 | 0.21 |
| 7.480000000000387 | 88.111 | 11.78 | 1.575 | 0.028 | 0.211 |
| 7.482500000000388 | 88.214 | 11.789 | 1.576 | 0.028 | 0.211 |
| 7.485000000000388 | 88.318 | 11.799 | 1.576 | 0.028 | 0.211 |
| 7.487500000000389 | 88.421 | 11.809 | 1.577 | 0.028 | 0.211 |
| 7.49000000000039 | 88.524 | 11.819 | 1.578 | 0.028 | 0.211 |
| 7.49250000000039 | 88.628 | 11.829 | 1.579 | 0.028 | 0.211 |
| 7.49500000000039 | 88.732 | 11.839 | 1.58 | 0.028 | 0.211 |
| 7.49750000000039 | 88.835 | 11.849 | 1.58 | 0.028 | 0.211 |
| 7.500000000000391 | 88.939 | 11.859 | 1.581 | 0.028 | 0.211 |
| 7.502500000000391 | 89.043 | 11.868 | 1.582 | 0.028 | 0.211 |
| 7.505000000000392 | 89.147 | 11.878 | 1.583 | 0.028 | 0.211 |
| 7.507500000000392 | 89.251 | 11.888 | 1.584 | 0.028 | 0.211 |
| 7.510000000000392 | 89.355 | 11.898 | 1.584 | 0.028 | 0.211 |
| 7.512500000000393 | 89.459 | 11.908 | 1.585 | 0.028 | 0.211 |
| 7.515000000000393 | 89.563 | 11.918 | 1.586 | 0.028 | 0.211 |
| 7.517500000000394 | 89.667 | 11.928 | 1.587 | 0.028 | 0.211 |
| 7.520000000000394 | 89.771 | 11.938 | 1.587 | 0.028 | 0.211 |
| 7.522500000000394 | 89.875 | 11.948 | 1.588 | 0.028 | 0.211 |
| 7.525000000000395 | 89.98 | 11.957 | 1.589 | 0.028 | 0.211 |
| 7.527500000000395 | 90.084 | 11.967 | 1.59 | 0.028 | 0.211 |
| 7.530000000000395 | 90.188 | 11.977 | 1.591 | 0.028 | 0.211 |
| 7.532500000000396 | 90.293 | 11.987 | 1.591 | 0.028 | 0.211 |
| 7.535000000000396 | 90.397 | 11.997 | 1.592 | 0.028 | 0.211 |
| 7.537500000000397 | 90.502 | 12.007 | 1.593 | 0.028 | 0.211 |
| 7.540000000000397 | 90.607 | 12.017 | 1.594 | 0.028 | 0.211 |
| 7.542500000000397 | 90.711 | 12.027 | 1.595 | 0.028 | 0.211 |
| 7.545000000000398 | 90.816 | 12.037 | 1.595 | 0.028 | 0.211 |
| 7.547500000000398 | 90.921 | 12.046 | 1.596 | 0.028 | 0.211 |
| 7.550000000000399 | 91.026 | 12.056 | 1.597 | 0.028 | 0.212 |
| 7.552500000000399 | 91.131 | 12.066 | 1.598 | 0.028 | 0.212 |
| 7.555000000000399 | 91.236 | 12.076 | 1.598 | 0.028 | 0.212 |
| 7.5575000000004 | 91.341 | 12.086 | 1.599 | 0.028 | 0.212 |
| 7.5600000000004 | 91.446 | 12.096 | 1.6 | 0.028 | 0.212 |
| 7.562500000000401 | 91.551 | 12.106 | 1.601 | 0.028 | 0.212 |
| 7.565000000000401 | 91.656 | 12.116 | 1.602 | 0.028 | 0.212 |
| 7.567500000000401 | 91.761 | 12.126 | 1.602 | 0.028 | 0.212 |
| 7.570000000000402 | 91.867 | 12.136 | 1.603 | 0.028 | 0.212 |
| 7.572500000000402 | 91.972 | 12.146 | 1.604 | 0.028 | 0.212 |
| 7.575000000000403 | 92.078 | 12.155 | 1.605 | 0.028 | 0.212 |
| 7.577500000000403 | 92.183 | 12.165 | 1.605 | 0.028 | 0.212 |
| 7.580000000000403 | 92.289 | 12.175 | 1.606 | 0.028 | 0.212 |
| 7.582500000000404 | 92.394 | 12.185 | 1.607 | 0.028 | 0.212 |
| 7.585000000000404 | 92.5 | 12.195 | 1.608 | 0.028 | 0.212 |
| 7.587500000000404 | 92.606 | 12.205 | 1.609 | 0.028 | 0.212 |
| 7.590000000000405 | 92.711 | 12.215 | 1.609 | 0.028 | 0.212 |
| 7.592500000000405 | 92.817 | 12.225 | 1.61 | 0.028 | 0.212 |
| 7.595000000000406 | 92.923 | 12.235 | 1.611 | 0.028 | 0.212 |
| 7.597500000000406 | 93.029 | 12.245 | 1.612 | 0.028 | 0.212 |
| 7.600000000000406 | 93.135 | 12.255 | 1.612 | 0.028 | 0.212 |
| 7.602500000000407 | 93.241 | 12.265 | 1.613 | 0.028 | 0.212 |
| 7.605000000000407 | 93.347 | 12.274 | 1.614 | 0.028 | 0.212 |
| 7.607500000000408 | 93.454 | 12.284 | 1.615 | 0.028 | 0.212 |
| 7.610000000000408 | 93.56 | 12.294 | 1.616 | 0.028 | 0.212 |
| 7.612500000000408 | 93.666 | 12.304 | 1.616 | 0.028 | 0.212 |
| 7.615000000000409 | 93.773 | 12.314 | 1.617 | 0.028 | 0.212 |
| 7.617500000000409 | 93.879 | 12.324 | 1.618 | 0.028 | 0.212 |
| 7.620000000000409 | 93.985 | 12.334 | 1.619 | 0.028 | 0.212 |
| 7.62250000000041 | 94.092 | 12.344 | 1.619 | 0.028 | 0.212 |
| 7.62500000000041 | 94.199 | 12.354 | 1.62 | 0.028 | 0.212 |
| 7.627500000000411 | 94.305 | 12.364 | 1.621 | 0.028 | 0.213 |
| 7.630000000000411 | 94.412 | 12.374 | 1.622 | 0.028 | 0.213 |
| 7.632500000000411 | 94.519 | 12.384 | 1.622 | 0.028 | 0.213 |
| 7.635000000000412 | 94.626 | 12.394 | 1.623 | 0.028 | 0.213 |
| 7.637500000000412 | 94.732 | 12.404 | 1.624 | 0.028 | 0.213 |
| 7.640000000000413 | 94.839 | 12.414 | 1.625 | 0.028 | 0.213 |
| 7.642500000000413 | 94.946 | 12.423 | 1.626 | 0.028 | 0.213 |
| 7.645000000000413 | 95.053 | 12.433 | 1.626 | 0.028 | 0.213 |
| 7.647500000000414 | 95.161 | 12.443 | 1.627 | 0.028 | 0.213 |
| 7.650000000000414 | 95.268 | 12.453 | 1.628 | 0.028 | 0.213 |
| 7.652500000000415 | 95.375 | 12.463 | 1.629 | 0.028 | 0.213 |
| 7.655000000000415 | 95.482 | 12.473 | 1.629 | 0.028 | 0.213 |
| 7.657500000000415 | 95.59 | 12.483 | 1.63 | 0.028 | 0.213 |
| 7.660000000000416 | 95.697 | 12.493 | 1.631 | 0.028 | 0.213 |
| 7.662500000000416 | 95.804 | 12.503 | 1.632 | 0.028 | 0.213 |
| 7.665000000000416 | 95.912 | 12.513 | 1.632 | 0.028 | 0.213 |
| 7.667500000000417 | 96.02 | 12.523 | 1.633 | 0.028 | 0.213 |
| 7.670000000000417 | 96.127 | 12.533 | 1.634 | 0.028 | 0.213 |
| 7.672500000000418 | 96.235 | 12.543 | 1.635 | 0.028 | 0.213 |
| 7.675000000000418 | 96.343 | 12.553 | 1.636 | 0.028 | 0.213 |
| 7.677500000000418 | 96.45 | 12.563 | 1.636 | 0.028 | 0.213 |
| 7.680000000000419 | 96.558 | 12.573 | 1.637 | 0.028 | 0.213 |
| 7.682500000000419 | 96.666 | 12.583 | 1.638 | 0.028 | 0.213 |
| 7.68500000000042 | 96.774 | 12.593 | 1.639 | 0.028 | 0.213 |
| 7.68750000000042 | 96.882 | 12.603 | 1.639 | 0.028 | 0.213 |
| 7.69000000000042 | 96.99 | 12.613 | 1.64 | 0.028 | 0.213 |
| 7.692500000000421 | 97.099 | 12.622 | 1.641 | 0.028 | 0.213 |
| 7.695000000000421 | 97.207 | 12.632 | 1.642 | 0.028 | 0.213 |
| 7.697500000000422 | 97.315 | 12.642 | 1.642 | 0.028 | 0.213 |
| 7.700000000000422 | 97.423 | 12.652 | 1.643 | 0.028 | 0.213 |
| 7.702500000000422 | 97.532 | 12.662 | 1.644 | 0.028 | 0.213 |
| 7.705000000000423 | 97.64 | 12.672 | 1.645 | 0.028 | 0.213 |
| 7.707500000000423 | 97.749 | 12.682 | 1.645 | 0.028 | 0.213 |
| 7.710000000000424 | 97.857 | 12.692 | 1.646 | 0.028 | 0.214 |
| 7.712500000000424 | 97.966 | 12.702 | 1.647 | 0.028 | 0.214 |
| 7.715000000000424 | 98.075 | 12.712 | 1.648 | 0.028 | 0.214 |
| 7.717500000000425 | 98.183 | 12.722 | 1.648 | 0.028 | 0.214 |
| 7.720000000000425 | 98.292 | 12.732 | 1.649 | 0.028 | 0.214 |
| 7.722500000000426 | 98.401 | 12.742 | 1.65 | 0.028 | 0.214 |
| 7.725000000000426 | 98.51 | 12.752 | 1.651 | 0.028 | 0.214 |
| 7.727500000000426 | 98.619 | 12.762 | 1.652 | 0.028 | 0.214 |
| 7.730000000000426 | 98.728 | 12.772 | 1.652 | 0.028 | 0.214 |
| 7.732500000000427 | 98.837 | 12.782 | 1.653 | 0.028 | 0.214 |
| 7.735000000000427 | 98.946 | 12.792 | 1.654 | 0.028 | 0.214 |
| 7.737500000000428 | 99.055 | 12.802 | 1.655 | 0.028 | 0.214 |
| 7.740000000000428 | 99.165 | 12.812 | 1.655 | 0.028 | 0.214 |
| 7.742500000000429 | 99.274 | 12.822 | 1.656 | 0.028 | 0.214 |
| 7.74500000000043 | 99.383 | 12.832 | 1.657 | 0.028 | 0.214 |
| 7.747500000000429 | 99.493 | 12.842 | 1.658 | 0.028 | 0.214 |
| 7.75000000000043 | 99.602 | 12.852 | 1.658 | 0.028 | 0.214 |
| 7.75250000000043 | 99.712 | 12.862 | 1.659 | 0.028 | 0.214 |
| 7.755000000000431 | 99.822 | 12.872 | 1.66 | 0.028 | 0.214 |
| 7.757500000000431 | 99.931 | 12.882 | 1.661 | 0.028 | 0.214 |
| 7.760000000000431 | 100.041 | 12.892 | 1.661 | 0.028 | 0.214 |
| 7.762500000000432 | 100.151 | 12.902 | 1.662 | 0.028 | 0.214 |
| 7.765000000000432 | 100.261 | 12.912 | 1.663 | 0.028 | 0.214 |
| 7.767500000000433 | 100.371 | 12.922 | 1.664 | 0.028 | 0.214 |
| 7.770000000000433 | 100.481 | 12.932 | 1.664 | 0.028 | 0.214 |
| 7.772500000000433 | 100.591 | 12.942 | 1.665 | 0.028 | 0.214 |
| 7.775000000000434 | 100.701 | 12.952 | 1.666 | 0.028 | 0.214 |
| 7.777500000000434 | 100.811 | 12.962 | 1.667 | 0.028 | 0.214 |
| 7.780000000000434 | 100.921 | 12.972 | 1.667 | 0.028 | 0.214 |
| 7.782500000000435 | 101.031 | 12.982 | 1.668 | 0.028 | 0.214 |
| 7.785000000000435 | 101.142 | 12.992 | 1.669 | 0.028 | 0.214 |
| 7.787500000000436 | 101.252 | 13.002 | 1.67 | 0.028 | 0.214 |
| 7.790000000000436 | 101.362 | 13.012 | 1.67 | 0.028 | 0.214 |
| 7.792500000000436 | 101.473 | 13.022 | 1.671 | 0.028 | 0.214 |
| 7.795000000000437 | 101.583 | 13.032 | 1.672 | 0.028 | 0.214 |
| 7.797500000000437 | 101.694 | 13.042 | 1.673 | 0.028 | 0.215 |
| 7.800000000000438 | 101.805 | 13.052 | 1.673 | 0.028 | 0.215 |
| 7.802500000000438 | 101.916 | 13.062 | 1.674 | 0.027 | 0.215 |
| 7.805000000000438 | 102.026 | 13.072 | 1.675 | 0.027 | 0.215 |
| 7.807500000000439 | 102.137 | 13.082 | 1.676 | 0.027 | 0.215 |
| 7.810000000000439 | 102.248 | 13.092 | 1.676 | 0.027 | 0.215 |
| 7.81250000000044 | 102.359 | 13.102 | 1.677 | 0.027 | 0.215 |
| 7.81500000000044 | 102.47 | 13.112 | 1.678 | 0.027 | 0.215 |
| 7.81750000000044 | 102.581 | 13.122 | 1.679 | 0.027 | 0.215 |
| 7.820000000000441 | 102.692 | 13.132 | 1.679 | 0.027 | 0.215 |
| 7.822500000000441 | 102.804 | 13.142 | 1.68 | 0.027 | 0.215 |
| 7.825000000000442 | 102.915 | 13.152 | 1.681 | 0.027 | 0.215 |
| 7.827500000000442 | 103.026 | 13.162 | 1.682 | 0.027 | 0.215 |
| 7.830000000000442 | 103.138 | 13.172 | 1.682 | 0.027 | 0.215 |
| 7.832500000000443 | 103.249 | 13.182 | 1.683 | 0.027 | 0.215 |
| 7.835000000000443 | 103.36 | 13.192 | 1.684 | 0.027 | 0.215 |
| 7.837500000000444 | 103.472 | 13.202 | 1.684 | 0.027 | 0.215 |
| 7.840000000000444 | 103.584 | 13.212 | 1.685 | 0.027 | 0.215 |
| 7.842500000000444 | 103.695 | 13.222 | 1.686 | 0.027 | 0.215 |
| 7.845000000000445 | 103.807 | 13.232 | 1.687 | 0.027 | 0.215 |
| 7.847500000000445 | 103.919 | 13.242 | 1.687 | 0.027 | 0.215 |
| 7.850000000000445 | 104.031 | 13.252 | 1.688 | 0.027 | 0.215 |
| 7.852500000000446 | 104.143 | 13.262 | 1.689 | 0.027 | 0.215 |
| 7.855000000000446 | 104.255 | 13.272 | 1.69 | 0.027 | 0.215 |
| 7.857500000000447 | 104.367 | 13.282 | 1.69 | 0.027 | 0.215 |
| 7.860000000000447 | 104.479 | 13.292 | 1.691 | 0.027 | 0.215 |
| 7.862500000000447 | 104.591 | 13.303 | 1.692 | 0.027 | 0.215 |
| 7.865000000000448 | 104.703 | 13.313 | 1.693 | 0.027 | 0.215 |
| 7.867500000000448 | 104.815 | 13.323 | 1.693 | 0.027 | 0.215 |
| 7.870000000000449 | 104.928 | 13.333 | 1.694 | 0.027 | 0.215 |
| 7.872500000000449 | 105.04 | 13.343 | 1.695 | 0.027 | 0.215 |
| 7.875000000000449 | 105.153 | 13.353 | 1.696 | 0.027 | 0.215 |
| 7.87750000000045 | 105.265 | 13.363 | 1.696 | 0.027 | 0.215 |
| 7.88000000000045 | 105.378 | 13.373 | 1.697 | 0.027 | 0.215 |
| 7.882500000000451 | 105.49 | 13.383 | 1.698 | 0.027 | 0.215 |
| 7.885000000000451 | 105.603 | 13.393 | 1.699 | 0.027 | 0.215 |
| 7.887500000000451 | 105.716 | 13.403 | 1.699 | 0.027 | 0.215 |
| 7.890000000000452 | 105.829 | 13.413 | 1.7 | 0.027 | 0.215 |
| 7.892500000000452 | 105.941 | 13.423 | 1.701 | 0.027 | 0.215 |
| 7.895000000000452 | 106.054 | 13.433 | 1.701 | 0.027 | 0.216 |
| 7.897500000000453 | 106.167 | 13.443 | 1.702 | 0.027 | 0.216 |
| 7.900000000000453 | 106.28 | 13.453 | 1.703 | 0.027 | 0.216 |
| 7.902500000000454 | 106.394 | 13.463 | 1.704 | 0.027 | 0.216 |
| 7.905000000000454 | 106.507 | 13.473 | 1.704 | 0.027 | 0.216 |
| 7.907500000000454 | 106.62 | 13.483 | 1.705 | 0.027 | 0.216 |
| 7.910000000000455 | 106.733 | 13.493 | 1.706 | 0.027 | 0.216 |
| 7.912500000000455 | 106.847 | 13.504 | 1.707 | 0.027 | 0.216 |
| 7.915000000000456 | 106.96 | 13.514 | 1.707 | 0.027 | 0.216 |
| 7.917500000000456 | 107.073 | 13.524 | 1.708 | 0.027 | 0.216 |
| 7.920000000000456 | 107.187 | 13.534 | 1.709 | 0.027 | 0.216 |
| 7.922500000000457 | 107.301 | 13.544 | 1.71 | 0.027 | 0.216 |
| 7.925000000000457 | 107.414 | 13.554 | 1.71 | 0.027 | 0.216 |
| 7.927500000000458 | 107.528 | 13.564 | 1.711 | 0.027 | 0.216 |
| 7.930000000000458 | 107.642 | 13.574 | 1.712 | 0.027 | 0.216 |
| 7.932500000000458 | 107.755 | 13.584 | 1.712 | 0.027 | 0.216 |
| 7.935000000000459 | 107.869 | 13.594 | 1.713 | 0.027 | 0.216 |
| 7.937500000000459 | 107.983 | 13.604 | 1.714 | 0.027 | 0.216 |
| 7.94000000000046 | 108.097 | 13.614 | 1.715 | 0.027 | 0.216 |
| 7.94250000000046 | 108.211 | 13.624 | 1.715 | 0.027 | 0.216 |
| 7.94500000000046 | 108.325 | 13.634 | 1.716 | 0.027 | 0.216 |
| 7.947500000000461 | 108.44 | 13.644 | 1.717 | 0.027 | 0.216 |
| 7.950000000000461 | 108.554 | 13.655 | 1.718 | 0.027 | 0.216 |
| 7.952500000000462 | 108.668 | 13.665 | 1.718 | 0.027 | 0.216 |
| 7.955000000000462 | 108.783 | 13.675 | 1.719 | 0.027 | 0.216 |
| 7.957500000000462 | 108.897 | 13.685 | 1.72 | 0.027 | 0.216 |
| 7.960000000000463 | 109.011 | 13.695 | 1.72 | 0.027 | 0.216 |
| 7.962500000000463 | 109.126 | 13.705 | 1.721 | 0.027 | 0.216 |
| 7.965000000000463 | 109.241 | 13.715 | 1.722 | 0.027 | 0.216 |
| 7.967500000000464 | 109.355 | 13.725 | 1.723 | 0.027 | 0.216 |
| 7.970000000000464 | 109.47 | 13.735 | 1.723 | 0.027 | 0.216 |
| 7.972500000000464 | 109.585 | 13.745 | 1.724 | 0.027 | 0.216 |
| 7.975000000000465 | 109.7 | 13.755 | 1.725 | 0.027 | 0.216 |
| 7.977500000000465 | 109.814 | 13.766 | 1.726 | 0.027 | 0.216 |
| 7.980000000000465 | 109.929 | 13.776 | 1.726 | 0.027 | 0.216 |
| 7.982500000000466 | 110.044 | 13.786 | 1.727 | 0.027 | 0.216 |
| 7.985000000000466 | 110.16 | 13.796 | 1.728 | 0.027 | 0.216 |
| 7.987500000000467 | 110.275 | 13.806 | 1.728 | 0.027 | 0.216 |
| 7.990000000000467 | 110.39 | 13.816 | 1.729 | 0.027 | 0.216 |
| 7.992500000000468 | 110.505 | 13.826 | 1.73 | 0.027 | 0.216 |
| 7.995000000000468 | 110.62 | 13.836 | 1.731 | 0.027 | 0.216 |
| 7.997500000000469 | 110.736 | 13.846 | 1.731 | 0.027 | 0.216 |
| 8.000000000000467 | 110.851 | 13.856 | 1.732 | 0.027 | 0.217 |
| 8.002500000000468 | 110.967 | 13.867 | 1.733 | 0.027 | 0.217 |
| 8.005000000000466 | 111.082 | 13.877 | 1.733 | 0.027 | 0.217 |
| 8.007500000000467 | 111.198 | 13.887 | 1.734 | 0.027 | 0.217 |
| 8.010000000000467 | 111.314 | 13.897 | 1.735 | 0.027 | 0.217 |
| 8.012500000000466 | 111.429 | 13.907 | 1.736 | 0.027 | 0.217 |
| 8.015000000000464 | 111.545 | 13.917 | 1.736 | 0.027 | 0.217 |
| 8.017500000000465 | 111.661 | 13.927 | 1.737 | 0.027 | 0.217 |
| 8.020000000000465 | 111.777 | 13.937 | 1.738 | 0.027 | 0.217 |
| 8.022500000000464 | 111.893 | 13.947 | 1.739 | 0.027 | 0.217 |
| 8.025000000000462 | 112.009 | 13.958 | 1.739 | 0.027 | 0.217 |
| 8.027500000000463 | 112.125 | 13.968 | 1.74 | 0.027 | 0.217 |
| 8.030000000000463 | 112.241 | 13.978 | 1.741 | 0.027 | 0.217 |
| 8.032500000000462 | 112.357 | 13.988 | 1.741 | 0.027 | 0.217 |
| 8.03500000000046 | 112.474 | 13.998 | 1.742 | 0.027 | 0.217 |
| 8.037500000000461 | 112.59 | 14.008 | 1.743 | 0.027 | 0.217 |
| 8.040000000000461 | 112.706 | 14.018 | 1.744 | 0.027 | 0.217 |
| 8.04250000000046 | 112.823 | 14.028 | 1.744 | 0.027 | 0.217 |
| 8.04500000000046 | 112.939 | 14.038 | 1.745 | 0.027 | 0.217 |
| 8.04750000000046 | 113.056 | 14.049 | 1.746 | 0.027 | 0.217 |
| 8.05000000000046 | 113.173 | 14.059 | 1.746 | 0.027 | 0.217 |
| 8.052500000000459 | 113.289 | 14.069 | 1.747 | 0.027 | 0.217 |
| 8.055000000000458 | 113.406 | 14.079 | 1.748 | 0.027 | 0.217 |
| 8.057500000000458 | 113.523 | 14.089 | 1.749 | 0.027 | 0.217 |
| 8.060000000000457 | 113.64 | 14.099 | 1.749 | 0.027 | 0.217 |
| 8.062500000000457 | 113.757 | 14.109 | 1.75 | 0.027 | 0.217 |
| 8.065000000000456 | 113.874 | 14.12 | 1.751 | 0.027 | 0.217 |
| 8.067500000000456 | 113.991 | 14.13 | 1.751 | 0.027 | 0.217 |
| 8.070000000000455 | 114.108 | 14.14 | 1.752 | 0.027 | 0.217 |
| 8.072500000000455 | 114.225 | 14.15 | 1.753 | 0.027 | 0.217 |
| 8.075000000000454 | 114.342 | 14.16 | 1.754 | 0.027 | 0.217 |
| 8.077500000000454 | 114.46 | 14.17 | 1.754 | 0.027 | 0.217 |
| 8.080000000000453 | 114.577 | 14.18 | 1.755 | 0.027 | 0.217 |
| 8.082500000000453 | 114.695 | 14.19 | 1.756 | 0.027 | 0.217 |
| 8.085000000000452 | 114.812 | 14.201 | 1.756 | 0.027 | 0.217 |
| 8.087500000000452 | 114.93 | 14.211 | 1.757 | 0.027 | 0.217 |
| 8.090000000000451 | 115.047 | 14.221 | 1.758 | 0.027 | 0.217 |
| 8.09250000000045 | 115.165 | 14.231 | 1.759 | 0.027 | 0.217 |
| 8.09500000000045 | 115.283 | 14.241 | 1.759 | 0.027 | 0.217 |
| 8.09750000000045 | 115.4 | 14.251 | 1.76 | 0.027 | 0.217 |
| 8.10000000000045 | 115.518 | 14.262 | 1.761 | 0.027 | 0.217 |
| 8.102500000000449 | 115.636 | 14.272 | 1.761 | 0.027 | 0.217 |
| 8.105000000000448 | 115.754 | 14.282 | 1.762 | 0.027 | 0.217 |
| 8.107500000000448 | 115.872 | 14.292 | 1.763 | 0.027 | 0.217 |
| 8.110000000000447 | 115.99 | 14.302 | 1.764 | 0.027 | 0.217 |
| 8.112500000000447 | 116.109 | 14.312 | 1.764 | 0.027 | 0.217 |
| 8.115000000000446 | 116.227 | 14.322 | 1.765 | 0.027 | 0.217 |
| 8.117500000000446 | 116.345 | 14.333 | 1.766 | 0.027 | 0.218 |
| 8.120000000000445 | 116.463 | 14.343 | 1.766 | 0.027 | 0.218 |
| 8.122500000000445 | 116.582 | 14.353 | 1.767 | 0.027 | 0.218 |
| 8.125000000000444 | 116.7 | 14.363 | 1.768 | 0.027 | 0.218 |
| 8.127500000000444 | 116.819 | 14.373 | 1.768 | 0.027 | 0.218 |
| 8.130000000000443 | 116.937 | 14.383 | 1.769 | 0.027 | 0.218 |
| 8.132500000000443 | 117.056 | 14.394 | 1.77 | 0.027 | 0.218 |
| 8.135000000000442 | 117.175 | 14.404 | 1.771 | 0.027 | 0.218 |
| 8.137500000000442 | 117.293 | 14.414 | 1.771 | 0.027 | 0.218 |
| 8.140000000000441 | 117.412 | 14.424 | 1.772 | 0.027 | 0.218 |
| 8.14250000000044 | 117.531 | 14.434 | 1.773 | 0.027 | 0.218 |
| 8.14500000000044 | 117.65 | 14.444 | 1.773 | 0.027 | 0.218 |
| 8.14750000000044 | 117.769 | 14.455 | 1.774 | 0.027 | 0.218 |
| 8.15000000000044 | 117.888 | 14.465 | 1.775 | 0.027 | 0.218 |
| 8.152500000000439 | 118.007 | 14.475 | 1.776 | 0.027 | 0.218 |
| 8.155000000000438 | 118.127 | 14.485 | 1.776 | 0.027 | 0.218 |
| 8.157500000000438 | 118.246 | 14.495 | 1.777 | 0.027 | 0.218 |
| 8.160000000000437 | 118.365 | 14.506 | 1.778 | 0.027 | 0.218 |
| 8.162500000000437 | 118.485 | 14.516 | 1.778 | 0.027 | 0.218 |
| 8.165000000000436 | 118.604 | 14.526 | 1.779 | 0.027 | 0.218 |
| 8.167500000000436 | 118.723 | 14.536 | 1.78 | 0.027 | 0.218 |
| 8.170000000000435 | 118.843 | 14.546 | 1.78 | 0.027 | 0.218 |
| 8.172500000000435 | 118.963 | 14.556 | 1.781 | 0.027 | 0.218 |
| 8.175000000000434 | 119.082 | 14.567 | 1.782 | 0.027 | 0.218 |
| 8.177500000000434 | 119.202 | 14.577 | 1.783 | 0.027 | 0.218 |
| 8.180000000000433 | 119.322 | 14.587 | 1.783 | 0.027 | 0.218 |
| 8.182500000000433 | 119.442 | 14.597 | 1.784 | 0.027 | 0.218 |
| 8.185000000000432 | 119.562 | 14.607 | 1.785 | 0.027 | 0.218 |
| 8.187500000000432 | 119.682 | 14.618 | 1.785 | 0.027 | 0.218 |
| 8.190000000000431 | 119.802 | 14.628 | 1.786 | 0.027 | 0.218 |
| 8.19250000000043 | 119.922 | 14.638 | 1.787 | 0.027 | 0.218 |
| 8.19500000000043 | 120.042 | 14.648 | 1.787 | 0.027 | 0.218 |
| 8.19750000000043 | 120.162 | 14.658 | 1.788 | 0.027 | 0.218 |
| 8.20000000000043 | 120.283 | 14.669 | 1.789 | 0.027 | 0.218 |
| 8.202500000000429 | 120.403 | 14.679 | 1.79 | 0.027 | 0.218 |
| 8.205000000000428 | 120.523 | 14.689 | 1.79 | 0.027 | 0.218 |
| 8.207500000000428 | 120.644 | 14.699 | 1.791 | 0.027 | 0.218 |
| 8.210000000000427 | 120.764 | 14.709 | 1.792 | 0.027 | 0.218 |
| 8.212500000000427 | 120.885 | 14.72 | 1.792 | 0.027 | 0.218 |
| 8.215000000000426 | 121.006 | 14.73 | 1.793 | 0.027 | 0.218 |
| 8.217500000000426 | 121.126 | 14.74 | 1.794 | 0.027 | 0.218 |
| 8.220000000000425 | 121.247 | 14.75 | 1.794 | 0.027 | 0.218 |
| 8.222500000000425 | 121.368 | 14.76 | 1.795 | 0.027 | 0.218 |
| 8.225000000000424 | 121.489 | 14.771 | 1.796 | 0.027 | 0.218 |
| 8.227500000000424 | 121.61 | 14.781 | 1.797 | 0.027 | 0.218 |
| 8.230000000000423 | 121.731 | 14.791 | 1.797 | 0.027 | 0.218 |
| 8.232500000000423 | 121.852 | 14.801 | 1.798 | 0.027 | 0.218 |
| 8.235000000000422 | 121.973 | 14.812 | 1.799 | 0.027 | 0.218 |
| 8.237500000000422 | 122.094 | 14.822 | 1.799 | 0.027 | 0.218 |
| 8.240000000000421 | 122.216 | 14.832 | 1.8 | 0.027 | 0.218 |
| 8.24250000000042 | 122.337 | 14.842 | 1.801 | 0.027 | 0.218 |
| 8.24500000000042 | 122.458 | 14.852 | 1.801 | 0.026 | 0.218 |
| 8.24750000000042 | 122.58 | 14.863 | 1.802 | 0.026 | 0.219 |
| 8.25000000000042 | 122.701 | 14.873 | 1.803 | 0.026 | 0.219 |
| 8.252500000000419 | 122.823 | 14.883 | 1.803 | 0.026 | 0.219 |
| 8.255000000000418 | 122.945 | 14.893 | 1.804 | 0.026 | 0.219 |
| 8.257500000000418 | 123.066 | 14.904 | 1.805 | 0.026 | 0.219 |
| 8.260000000000417 | 123.188 | 14.914 | 1.806 | 0.026 | 0.219 |
| 8.262500000000417 | 123.31 | 14.924 | 1.806 | 0.026 | 0.219 |
| 8.265000000000416 | 123.432 | 14.934 | 1.807 | 0.026 | 0.219 |
| 8.267500000000416 | 123.554 | 14.945 | 1.808 | 0.026 | 0.219 |
| 8.270000000000415 | 123.676 | 14.955 | 1.808 | 0.026 | 0.219 |
| 8.272500000000415 | 123.798 | 14.965 | 1.809 | 0.026 | 0.219 |
| 8.275000000000414 | 123.92 | 14.975 | 1.81 | 0.026 | 0.219 |
| 8.277500000000414 | 124.042 | 14.985 | 1.81 | 0.026 | 0.219 |
| 8.280000000000413 | 124.165 | 14.996 | 1.811 | 0.026 | 0.219 |
| 8.282500000000413 | 124.287 | 15.006 | 1.812 | 0.026 | 0.219 |
| 8.285000000000412 | 124.409 | 15.016 | 1.812 | 0.026 | 0.219 |
| 8.287500000000412 | 124.532 | 15.026 | 1.813 | 0.026 | 0.219 |
| 8.290000000000411 | 124.654 | 15.037 | 1.814 | 0.026 | 0.219 |
| 8.29250000000041 | 124.777 | 15.047 | 1.815 | 0.026 | 0.219 |
| 8.29500000000041 | 124.899 | 15.057 | 1.815 | 0.026 | 0.219 |
| 8.29750000000041 | 125.022 | 15.067 | 1.816 | 0.026 | 0.219 |
| 8.30000000000041 | 125.145 | 15.078 | 1.817 | 0.026 | 0.219 |
| 8.302500000000409 | 125.268 | 15.088 | 1.817 | 0.026 | 0.219 |
| 8.305000000000408 | 125.391 | 15.098 | 1.818 | 0.026 | 0.219 |
| 8.307500000000408 | 125.514 | 15.108 | 1.819 | 0.026 | 0.219 |
| 8.310000000000407 | 125.637 | 15.119 | 1.819 | 0.026 | 0.219 |
| 8.312500000000407 | 125.76 | 15.129 | 1.82 | 0.026 | 0.219 |
| 8.315000000000406 | 125.883 | 15.139 | 1.821 | 0.026 | 0.219 |
| 8.317500000000406 | 126.006 | 15.149 | 1.821 | 0.026 | 0.219 |
| 8.320000000000405 | 126.129 | 15.16 | 1.822 | 0.026 | 0.219 |
| 8.322500000000405 | 126.253 | 15.17 | 1.823 | 0.026 | 0.219 |
| 8.325000000000404 | 126.376 | 15.18 | 1.823 | 0.026 | 0.219 |
| 8.327500000000404 | 126.499 | 15.191 | 1.824 | 0.026 | 0.219 |
| 8.330000000000403 | 126.623 | 15.201 | 1.825 | 0.026 | 0.219 |
| 8.332500000000403 | 126.746 | 15.211 | 1.826 | 0.026 | 0.219 |
| 8.335000000000402 | 126.87 | 15.221 | 1.826 | 0.026 | 0.219 |
| 8.337500000000402 | 126.994 | 15.232 | 1.827 | 0.026 | 0.219 |
| 8.340000000000401 | 127.117 | 15.242 | 1.828 | 0.026 | 0.219 |
| 8.3425000000004 | 127.241 | 15.252 | 1.828 | 0.026 | 0.219 |
| 8.3450000000004 | 127.365 | 15.262 | 1.829 | 0.026 | 0.219 |
| 8.3475000000004 | 127.489 | 15.273 | 1.83 | 0.026 | 0.219 |
| 8.3500000000004 | 127.613 | 15.283 | 1.83 | 0.026 | 0.219 |
| 8.352500000000399 | 127.737 | 15.293 | 1.831 | 0.026 | 0.219 |
| 8.355000000000398 | 127.861 | 15.304 | 1.832 | 0.026 | 0.219 |
| 8.357500000000398 | 127.986 | 15.314 | 1.832 | 0.026 | 0.219 |
| 8.360000000000397 | 128.11 | 15.324 | 1.833 | 0.026 | 0.219 |
| 8.362500000000397 | 128.234 | 15.334 | 1.834 | 0.026 | 0.219 |
| 8.365000000000396 | 128.358 | 15.345 | 1.834 | 0.026 | 0.219 |
| 8.367500000000396 | 128.483 | 15.355 | 1.835 | 0.026 | 0.219 |
| 8.370000000000395 | 128.607 | 15.365 | 1.836 | 0.026 | 0.219 |
| 8.372500000000395 | 128.732 | 15.376 | 1.836 | 0.026 | 0.219 |
| 8.375000000000394 | 128.857 | 15.386 | 1.837 | 0.026 | 0.219 |
| 8.377500000000394 | 128.981 | 15.396 | 1.838 | 0.026 | 0.219 |
| 8.380000000000393 | 129.106 | 15.406 | 1.838 | 0.026 | 0.219 |
| 8.38250000000039 | 129.231 | 15.417 | 1.839 | 0.026 | 0.219 |
| 8.38500000000039 | 129.356 | 15.427 | 1.84 | 0.026 | 0.219 |
| 8.38750000000039 | 129.481 | 15.437 | 1.841 | 0.026 | 0.219 |
| 8.39000000000039 | 129.606 | 15.448 | 1.841 | 0.026 | 0.219 |
| 8.39250000000039 | 129.731 | 15.458 | 1.842 | 0.026 | 0.219 |
| 8.39500000000039 | 129.856 | 15.468 | 1.843 | 0.026 | 0.219 |
| 8.39750000000039 | 129.981 | 15.479 | 1.843 | 0.026 | 0.219 |
| 8.40000000000039 | 130.106 | 15.489 | 1.844 | 0.026 | 0.22 |
| 8.402500000000389 | 130.232 | 15.499 | 1.845 | 0.026 | 0.22 |
| 8.405000000000388 | 130.357 | 15.509 | 1.845 | 0.026 | 0.22 |
| 8.407500000000388 | 130.482 | 15.52 | 1.846 | 0.026 | 0.22 |
| 8.410000000000387 | 130.608 | 15.53 | 1.847 | 0.026 | 0.22 |
| 8.412500000000385 | 130.733 | 15.54 | 1.847 | 0.026 | 0.22 |
| 8.415000000000386 | 130.859 | 15.551 | 1.848 | 0.026 | 0.22 |
| 8.417500000000384 | 130.985 | 15.561 | 1.849 | 0.026 | 0.22 |
| 8.420000000000385 | 131.11 | 15.571 | 1.849 | 0.026 | 0.22 |
| 8.422500000000383 | 131.236 | 15.582 | 1.85 | 0.026 | 0.22 |
| 8.425000000000384 | 131.362 | 15.592 | 1.851 | 0.026 | 0.22 |
| 8.427500000000382 | 131.488 | 15.602 | 1.851 | 0.026 | 0.22 |
| 8.430000000000383 | 131.614 | 15.613 | 1.852 | 0.026 | 0.22 |
| 8.432500000000381 | 131.74 | 15.623 | 1.853 | 0.026 | 0.22 |
| 8.435000000000382 | 131.866 | 15.633 | 1.853 | 0.026 | 0.22 |
| 8.43750000000038 | 131.992 | 15.644 | 1.854 | 0.026 | 0.22 |
| 8.440000000000381 | 132.119 | 15.654 | 1.855 | 0.026 | 0.22 |
| 8.44250000000038 | 132.245 | 15.664 | 1.855 | 0.026 | 0.22 |
| 8.44500000000038 | 132.371 | 15.675 | 1.856 | 0.026 | 0.22 |
| 8.44750000000038 | 132.498 | 15.685 | 1.857 | 0.026 | 0.22 |
| 8.45000000000038 | 132.624 | 15.695 | 1.857 | 0.026 | 0.22 |
| 8.452500000000377 | 132.751 | 15.706 | 1.858 | 0.026 | 0.22 |
| 8.455000000000378 | 132.877 | 15.716 | 1.859 | 0.026 | 0.22 |
| 8.457500000000376 | 133.004 | 15.726 | 1.859 | 0.026 | 0.22 |
| 8.460000000000377 | 133.131 | 15.737 | 1.86 | 0.026 | 0.22 |
| 8.462500000000375 | 133.258 | 15.747 | 1.861 | 0.026 | 0.22 |
| 8.465000000000376 | 133.385 | 15.757 | 1.861 | 0.026 | 0.22 |
| 8.467500000000374 | 133.511 | 15.768 | 1.862 | 0.026 | 0.22 |
| 8.470000000000375 | 133.638 | 15.778 | 1.863 | 0.026 | 0.22 |
| 8.472500000000373 | 133.766 | 15.788 | 1.863 | 0.026 | 0.22 |
| 8.475000000000374 | 133.893 | 15.799 | 1.864 | 0.026 | 0.22 |
| 8.477500000000372 | 134.02 | 15.809 | 1.865 | 0.026 | 0.22 |
| 8.480000000000373 | 134.147 | 15.819 | 1.865 | 0.026 | 0.22 |
| 8.482500000000371 | 134.274 | 15.83 | 1.866 | 0.026 | 0.22 |
| 8.485000000000372 | 134.402 | 15.84 | 1.867 | 0.026 | 0.22 |
| 8.48750000000037 | 134.529 | 15.85 | 1.867 | 0.026 | 0.22 |
| 8.490000000000371 | 134.657 | 15.861 | 1.868 | 0.026 | 0.22 |
| 8.49250000000037 | 134.784 | 15.871 | 1.869 | 0.026 | 0.22 |
| 8.49500000000037 | 134.912 | 15.881 | 1.869 | 0.026 | 0.22 |
| 8.49750000000037 | 135.04 | 15.892 | 1.87 | 0.026 | 0.22 |
| 8.50000000000037 | 135.167 | 15.902 | 1.871 | 0.026 | 0.22 |
| 8.502500000000367 | 135.295 | 15.912 | 1.871 | 0.026 | 0.22 |
| 8.505000000000368 | 135.423 | 15.923 | 1.872 | 0.026 | 0.22 |
| 8.507500000000366 | 135.551 | 15.933 | 1.873 | 0.026 | 0.22 |
| 8.510000000000367 | 135.679 | 15.943 | 1.873 | 0.026 | 0.22 |
| 8.512500000000365 | 135.807 | 15.954 | 1.874 | 0.026 | 0.22 |
| 8.515000000000366 | 135.935 | 15.964 | 1.875 | 0.026 | 0.22 |
| 8.517500000000364 | 136.063 | 15.975 | 1.875 | 0.026 | 0.22 |
| 8.520000000000366 | 136.192 | 15.985 | 1.876 | 0.026 | 0.22 |
| 8.522500000000365 | 136.32 | 15.995 | 1.877 | 0.026 | 0.22 |
| 8.525000000000365 | 136.448 | 16.006 | 1.877 | 0.026 | 0.22 |
| 8.527500000000364 | 136.577 | 16.016 | 1.878 | 0.026 | 0.22 |
| 8.530000000000364 | 136.705 | 16.026 | 1.879 | 0.026 | 0.22 |
| 8.532500000000363 | 136.834 | 16.037 | 1.879 | 0.026 | 0.22 |
| 8.535000000000363 | 136.963 | 16.047 | 1.88 | 0.026 | 0.22 |
| 8.537500000000362 | 137.091 | 16.058 | 1.881 | 0.026 | 0.22 |
| 8.540000000000362 | 137.22 | 16.068 | 1.881 | 0.026 | 0.22 |
| 8.54250000000036 | 137.349 | 16.078 | 1.882 | 0.026 | 0.22 |
| 8.54500000000036 | 137.478 | 16.089 | 1.883 | 0.026 | 0.22 |
| 8.54750000000036 | 137.607 | 16.099 | 1.883 | 0.026 | 0.22 |
| 8.55000000000036 | 137.736 | 16.109 | 1.884 | 0.026 | 0.22 |
| 8.55250000000036 | 137.865 | 16.12 | 1.885 | 0.026 | 0.22 |
| 8.555000000000359 | 137.994 | 16.13 | 1.885 | 0.026 | 0.22 |
| 8.557500000000358 | 138.123 | 16.141 | 1.886 | 0.026 | 0.22 |
| 8.560000000000358 | 138.252 | 16.151 | 1.887 | 0.026 | 0.22 |
| 8.562500000000357 | 138.382 | 16.161 | 1.887 | 0.026 | 0.22 |
| 8.565000000000357 | 138.511 | 16.172 | 1.888 | 0.026 | 0.22 |
| 8.567500000000356 | 138.641 | 16.182 | 1.889 | 0.026 | 0.22 |
| 8.570000000000356 | 138.77 | 16.193 | 1.889 | 0.026 | 0.22 |
| 8.572500000000355 | 138.9 | 16.203 | 1.89 | 0.026 | 0.22 |
| 8.575000000000355 | 139.029 | 16.213 | 1.891 | 0.026 | 0.22 |
| 8.577500000000354 | 139.159 | 16.224 | 1.891 | 0.026 | 0.221 |
| 8.580000000000354 | 139.289 | 16.234 | 1.892 | 0.026 | 0.221 |
| 8.582500000000353 | 139.419 | 16.245 | 1.893 | 0.026 | 0.221 |
| 8.585000000000353 | 139.549 | 16.255 | 1.893 | 0.026 | 0.221 |
| 8.587500000000352 | 139.678 | 16.265 | 1.894 | 0.026 | 0.221 |
| 8.590000000000352 | 139.808 | 16.276 | 1.895 | 0.026 | 0.221 |
| 8.59250000000035 | 139.939 | 16.286 | 1.895 | 0.026 | 0.221 |
| 8.59500000000035 | 140.069 | 16.297 | 1.896 | 0.026 | 0.221 |
| 8.59750000000035 | 140.199 | 16.307 | 1.897 | 0.026 | 0.221 |
| 8.60000000000035 | 140.329 | 16.317 | 1.897 | 0.026 | 0.221 |
| 8.60250000000035 | 140.46 | 16.328 | 1.898 | 0.026 | 0.221 |
| 8.605000000000349 | 140.59 | 16.338 | 1.899 | 0.026 | 0.221 |
| 8.607500000000348 | 140.72 | 16.349 | 1.899 | 0.026 | 0.221 |
| 8.610000000000348 | 140.851 | 16.359 | 1.9 | 0.026 | 0.221 |
| 8.612500000000347 | 140.982 | 16.369 | 1.901 | 0.026 | 0.221 |
| 8.615000000000347 | 141.112 | 16.38 | 1.901 | 0.026 | 0.221 |
| 8.617500000000346 | 141.243 | 16.39 | 1.902 | 0.026 | 0.221 |
| 8.620000000000346 | 141.374 | 16.401 | 1.903 | 0.026 | 0.221 |
| 8.622500000000345 | 141.505 | 16.411 | 1.903 | 0.026 | 0.221 |
| 8.625000000000345 | 141.636 | 16.422 | 1.904 | 0.026 | 0.221 |
| 8.627500000000344 | 141.767 | 16.432 | 1.905 | 0.026 | 0.221 |
| 8.630000000000344 | 141.898 | 16.442 | 1.905 | 0.026 | 0.221 |
| 8.632500000000343 | 142.029 | 16.453 | 1.906 | 0.026 | 0.221 |
| 8.635000000000343 | 142.16 | 16.463 | 1.907 | 0.026 | 0.221 |
| 8.637500000000342 | 142.291 | 16.474 | 1.907 | 0.026 | 0.221 |
| 8.640000000000342 | 142.422 | 16.484 | 1.908 | 0.026 | 0.221 |
| 8.64250000000034 | 142.554 | 16.495 | 1.909 | 0.026 | 0.221 |
| 8.64500000000034 | 142.685 | 16.505 | 1.909 | 0.026 | 0.221 |
| 8.64750000000034 | 142.817 | 16.515 | 1.91 | 0.026 | 0.221 |
| 8.65000000000034 | 142.948 | 16.526 | 1.91 | 0.026 | 0.221 |
| 8.65250000000034 | 143.08 | 16.536 | 1.911 | 0.026 | 0.221 |
| 8.655000000000339 | 143.211 | 16.547 | 1.912 | 0.026 | 0.221 |
| 8.657500000000338 | 143.343 | 16.557 | 1.912 | 0.026 | 0.221 |
| 8.660000000000338 | 143.475 | 16.568 | 1.913 | 0.026 | 0.221 |
| 8.662500000000337 | 143.607 | 16.578 | 1.914 | 0.026 | 0.221 |
| 8.665000000000337 | 143.739 | 16.588 | 1.914 | 0.025 | 0.221 |
| 8.667500000000336 | 143.871 | 16.599 | 1.915 | 0.025 | 0.221 |
| 8.670000000000336 | 144.003 | 16.609 | 1.916 | 0.025 | 0.221 |
| 8.672500000000335 | 144.135 | 16.62 | 1.916 | 0.025 | 0.221 |
| 8.675000000000335 | 144.267 | 16.63 | 1.917 | 0.025 | 0.221 |
| 8.677500000000334 | 144.399 | 16.641 | 1.918 | 0.025 | 0.221 |
| 8.680000000000334 | 144.532 | 16.651 | 1.918 | 0.025 | 0.221 |
| 8.682500000000333 | 144.664 | 16.662 | 1.919 | 0.025 | 0.221 |
| 8.685000000000333 | 144.797 | 16.672 | 1.92 | 0.025 | 0.221 |
| 8.687500000000332 | 144.929 | 16.682 | 1.92 | 0.025 | 0.221 |
| 8.690000000000332 | 145.062 | 16.693 | 1.921 | 0.025 | 0.221 |
| 8.69250000000033 | 145.194 | 16.703 | 1.922 | 0.025 | 0.221 |
| 8.69500000000033 | 145.327 | 16.714 | 1.922 | 0.025 | 0.221 |
| 8.69750000000033 | 145.46 | 16.724 | 1.923 | 0.025 | 0.221 |
| 8.70000000000033 | 145.593 | 16.735 | 1.924 | 0.025 | 0.221 |
| 8.70250000000033 | 145.726 | 16.745 | 1.924 | 0.025 | 0.221 |
| 8.705000000000329 | 145.858 | 16.756 | 1.925 | 0.025 | 0.221 |
| 8.707500000000328 | 145.991 | 16.766 | 1.925 | 0.025 | 0.221 |
| 8.710000000000328 | 146.125 | 16.777 | 1.926 | 0.025 | 0.221 |
| 8.712500000000327 | 146.258 | 16.787 | 1.927 | 0.025 | 0.221 |
| 8.715000000000327 | 146.391 | 16.798 | 1.927 | 0.025 | 0.221 |
| 8.717500000000326 | 146.524 | 16.808 | 1.928 | 0.025 | 0.221 |
| 8.720000000000326 | 146.658 | 16.819 | 1.929 | 0.025 | 0.221 |
| 8.722500000000325 | 146.791 | 16.829 | 1.929 | 0.025 | 0.221 |
| 8.725000000000325 | 146.924 | 16.839 | 1.93 | 0.025 | 0.221 |
| 8.727500000000324 | 147.058 | 16.85 | 1.931 | 0.025 | 0.221 |
| 8.730000000000324 | 147.192 | 16.86 | 1.931 | 0.025 | 0.221 |
| 8.732500000000323 | 147.325 | 16.871 | 1.932 | 0.025 | 0.221 |
| 8.735000000000323 | 147.459 | 16.881 | 1.933 | 0.025 | 0.221 |
| 8.737500000000322 | 147.593 | 16.892 | 1.933 | 0.025 | 0.221 |
| 8.740000000000322 | 147.727 | 16.902 | 1.934 | 0.025 | 0.221 |
| 8.742500000000321 | 147.861 | 16.913 | 1.935 | 0.025 | 0.221 |
| 8.74500000000032 | 147.994 | 16.923 | 1.935 | 0.025 | 0.221 |
| 8.74750000000032 | 148.129 | 16.934 | 1.936 | 0.025 | 0.221 |
| 8.75000000000032 | 148.263 | 16.944 | 1.936 | 0.025 | 0.221 |
| 8.75250000000032 | 148.397 | 16.955 | 1.937 | 0.025 | 0.221 |
| 8.755000000000319 | 148.531 | 16.965 | 1.938 | 0.025 | 0.221 |
| 8.757500000000318 | 148.665 | 16.976 | 1.938 | 0.025 | 0.221 |
| 8.760000000000318 | 148.8 | 16.986 | 1.939 | 0.025 | 0.221 |
| 8.762500000000317 | 148.934 | 16.997 | 1.94 | 0.025 | 0.221 |
| 8.765000000000317 | 149.069 | 17.007 | 1.94 | 0.025 | 0.221 |
| 8.767500000000316 | 149.203 | 17.018 | 1.941 | 0.025 | 0.221 |
| 8.770000000000316 | 149.338 | 17.028 | 1.942 | 0.025 | 0.221 |
| 8.772500000000315 | 149.473 | 17.039 | 1.942 | 0.025 | 0.221 |
| 8.775000000000315 | 149.607 | 17.049 | 1.943 | 0.025 | 0.221 |
| 8.777500000000314 | 149.742 | 17.06 | 1.944 | 0.025 | 0.221 |
| 8.780000000000314 | 149.877 | 17.07 | 1.944 | 0.025 | 0.221 |
| 8.782500000000313 | 150.012 | 17.081 | 1.945 | 0.025 | 0.221 |
| 8.785000000000313 | 150.147 | 17.091 | 1.946 | 0.025 | 0.221 |
| 8.787500000000312 | 150.282 | 17.102 | 1.946 | 0.025 | 0.221 |
| 8.790000000000312 | 150.417 | 17.112 | 1.947 | 0.025 | 0.221 |
| 8.79250000000031 | 150.552 | 17.123 | 1.947 | 0.025 | 0.221 |
| 8.79500000000031 | 150.688 | 17.133 | 1.948 | 0.025 | 0.221 |
| 8.79750000000031 | 150.823 | 17.144 | 1.949 | 0.025 | 0.222 |
| 8.80000000000031 | 150.958 | 17.154 | 1.949 | 0.025 | 0.222 |
| 8.80250000000031 | 151.094 | 17.165 | 1.95 | 0.025 | 0.222 |
| 8.805000000000309 | 151.229 | 17.175 | 1.951 | 0.025 | 0.222 |
| 8.807500000000308 | 151.365 | 17.186 | 1.951 | 0.025 | 0.222 |
| 8.810000000000308 | 151.501 | 17.196 | 1.952 | 0.025 | 0.222 |
| 8.812500000000307 | 151.636 | 17.207 | 1.953 | 0.025 | 0.222 |
| 8.815000000000307 | 151.772 | 17.217 | 1.953 | 0.025 | 0.222 |
| 8.817500000000306 | 151.908 | 17.228 | 1.954 | 0.025 | 0.222 |
| 8.820000000000306 | 152.044 | 17.239 | 1.954 | 0.025 | 0.222 |
| 8.822500000000305 | 152.18 | 17.249 | 1.955 | 0.025 | 0.222 |
| 8.825000000000305 | 152.316 | 17.26 | 1.956 | 0.025 | 0.222 |
| 8.827500000000304 | 152.452 | 17.27 | 1.956 | 0.025 | 0.222 |
| 8.830000000000304 | 152.588 | 17.281 | 1.957 | 0.025 | 0.222 |
| 8.832500000000303 | 152.724 | 17.291 | 1.958 | 0.025 | 0.222 |
| 8.835000000000303 | 152.861 | 17.302 | 1.958 | 0.025 | 0.222 |
| 8.837500000000302 | 152.997 | 17.312 | 1.959 | 0.025 | 0.222 |
| 8.840000000000302 | 153.133 | 17.323 | 1.96 | 0.025 | 0.222 |
| 8.8425000000003 | 153.27 | 17.333 | 1.96 | 0.025 | 0.222 |
| 8.8450000000003 | 153.407 | 17.344 | 1.961 | 0.025 | 0.222 |
| 8.8475000000003 | 153.543 | 17.354 | 1.962 | 0.025 | 0.222 |
| 8.8500000000003 | 153.68 | 17.365 | 1.962 | 0.025 | 0.222 |
| 8.8525000000003 | 153.817 | 17.375 | 1.963 | 0.025 | 0.222 |
| 8.855000000000299 | 153.953 | 17.386 | 1.963 | 0.025 | 0.222 |
| 8.857500000000298 | 154.09 | 17.397 | 1.964 | 0.025 | 0.222 |
| 8.860000000000298 | 154.227 | 17.407 | 1.965 | 0.025 | 0.222 |
| 8.862500000000297 | 154.364 | 17.418 | 1.965 | 0.025 | 0.222 |
| 8.865000000000297 | 154.501 | 17.428 | 1.966 | 0.025 | 0.222 |
| 8.867500000000296 | 154.638 | 17.439 | 1.967 | 0.025 | 0.222 |
| 8.870000000000296 | 154.776 | 17.449 | 1.967 | 0.025 | 0.222 |
| 8.872500000000295 | 154.913 | 17.46 | 1.968 | 0.025 | 0.222 |
| 8.875000000000295 | 155.05 | 17.47 | 1.969 | 0.025 | 0.222 |
| 8.877500000000294 | 155.188 | 17.481 | 1.969 | 0.025 | 0.222 |
| 8.880000000000294 | 155.325 | 17.492 | 1.97 | 0.025 | 0.222 |
| 8.88250000000029 | 155.463 | 17.502 | 1.97 | 0.025 | 0.222 |
| 8.88500000000029 | 155.6 | 17.513 | 1.971 | 0.025 | 0.222 |
| 8.88750000000029 | 155.738 | 17.523 | 1.972 | 0.025 | 0.222 |
| 8.89000000000029 | 155.876 | 17.534 | 1.972 | 0.025 | 0.222 |
| 8.89250000000029 | 156.013 | 17.544 | 1.973 | 0.025 | 0.222 |
| 8.89500000000029 | 156.151 | 17.555 | 1.974 | 0.025 | 0.222 |
| 8.89750000000029 | 156.289 | 17.566 | 1.974 | 0.025 | 0.222 |
| 8.90000000000029 | 156.427 | 17.576 | 1.975 | 0.025 | 0.222 |
| 8.90250000000029 | 156.565 | 17.587 | 1.975 | 0.025 | 0.222 |
| 8.905000000000287 | 156.703 | 17.597 | 1.976 | 0.025 | 0.222 |
| 8.907500000000288 | 156.842 | 17.608 | 1.977 | 0.025 | 0.222 |
| 8.910000000000286 | 156.98 | 17.618 | 1.977 | 0.025 | 0.222 |
| 8.912500000000287 | 157.118 | 17.629 | 1.978 | 0.025 | 0.222 |
| 8.915000000000285 | 157.256 | 17.64 | 1.979 | 0.025 | 0.222 |
| 8.917500000000286 | 157.395 | 17.65 | 1.979 | 0.025 | 0.222 |
| 8.920000000000284 | 157.533 | 17.661 | 1.98 | 0.025 | 0.222 |
| 8.922500000000285 | 157.672 | 17.671 | 1.981 | 0.025 | 0.222 |
| 8.925000000000283 | 157.811 | 17.682 | 1.981 | 0.025 | 0.222 |
| 8.927500000000284 | 157.949 | 17.692 | 1.982 | 0.025 | 0.222 |
| 8.930000000000282 | 158.088 | 17.703 | 1.982 | 0.025 | 0.222 |
| 8.932500000000283 | 158.227 | 17.714 | 1.983 | 0.025 | 0.222 |
| 8.935000000000281 | 158.366 | 17.724 | 1.984 | 0.025 | 0.222 |
| 8.937500000000282 | 158.505 | 17.735 | 1.984 | 0.025 | 0.222 |
| 8.94000000000028 | 158.644 | 17.745 | 1.985 | 0.025 | 0.222 |
| 8.94250000000028 | 158.783 | 17.756 | 1.986 | 0.025 | 0.222 |
| 8.94500000000028 | 158.922 | 17.767 | 1.986 | 0.025 | 0.222 |
| 8.94750000000028 | 159.061 | 17.777 | 1.987 | 0.025 | 0.222 |
| 8.95000000000028 | 159.201 | 17.788 | 1.987 | 0.025 | 0.222 |
| 8.95250000000028 | 159.34 | 17.798 | 1.988 | 0.025 | 0.222 |
| 8.955000000000277 | 159.479 | 17.809 | 1.989 | 0.025 | 0.222 |
| 8.957500000000278 | 159.619 | 17.82 | 1.989 | 0.025 | 0.222 |
| 8.960000000000276 | 159.758 | 17.83 | 1.99 | 0.025 | 0.222 |
| 8.962500000000277 | 159.898 | 17.841 | 1.991 | 0.025 | 0.222 |
| 8.965000000000275 | 160.038 | 17.851 | 1.991 | 0.025 | 0.222 |
| 8.967500000000276 | 160.177 | 17.862 | 1.992 | 0.025 | 0.222 |
| 8.970000000000274 | 160.317 | 17.873 | 1.992 | 0.025 | 0.222 |
| 8.972500000000275 | 160.457 | 17.883 | 1.993 | 0.025 | 0.222 |
| 8.975000000000273 | 160.597 | 17.894 | 1.994 | 0.025 | 0.222 |
| 8.977500000000274 | 160.737 | 17.904 | 1.994 | 0.025 | 0.222 |
| 8.980000000000272 | 160.877 | 17.915 | 1.995 | 0.025 | 0.222 |
| 8.982500000000273 | 161.017 | 17.926 | 1.996 | 0.025 | 0.222 |
| 8.985000000000271 | 161.157 | 17.936 | 1.996 | 0.025 | 0.222 |
| 8.987500000000272 | 161.298 | 17.947 | 1.997 | 0.025 | 0.222 |
| 8.99000000000027 | 161.438 | 17.958 | 1.997 | 0.025 | 0.222 |
| 8.99250000000027 | 161.578 | 17.968 | 1.998 | 0.025 | 0.222 |
| 8.99500000000027 | 161.719 | 17.979 | 1.999 | 0.025 | 0.222 |
| 8.99750000000027 | 161.859 | 17.989 | 1.999 | 0.025 | 0.222 |
| 9.00000000000027 | 162 | 18 | 2 | 0.025 | 0.222 |
| 9.00250000000027 | 162.141 | 18.011 | 2.001 | 0.025 | 0.222 |
| 9.00500000000027 | 162.281 | 18.021 | 2.001 | 0.025 | 0.222 |
| 9.007500000000269 | 162.422 | 18.032 | 2.002 | 0.025 | 0.222 |
| 9.010000000000268 | 162.563 | 18.043 | 2.002 | 0.025 | 0.222 |
| 9.012500000000268 | 162.704 | 18.053 | 2.003 | 0.025 | 0.222 |
| 9.015000000000267 | 162.845 | 18.064 | 2.004 | 0.025 | 0.222 |
| 9.017500000000267 | 162.986 | 18.074 | 2.004 | 0.025 | 0.222 |
| 9.020000000000266 | 163.127 | 18.085 | 2.005 | 0.025 | 0.222 |
| 9.022500000000266 | 163.268 | 18.096 | 2.006 | 0.025 | 0.222 |
| 9.025000000000265 | 163.41 | 18.106 | 2.006 | 0.025 | 0.222 |
| 9.027500000000265 | 163.551 | 18.117 | 2.007 | 0.025 | 0.222 |
| 9.030000000000264 | 163.692 | 18.128 | 2.007 | 0.025 | 0.222 |
| 9.032500000000264 | 163.834 | 18.138 | 2.008 | 0.025 | 0.222 |
| 9.035000000000263 | 163.975 | 18.149 | 2.009 | 0.025 | 0.222 |
| 9.037500000000263 | 164.117 | 18.16 | 2.009 | 0.025 | 0.222 |
| 9.040000000000262 | 164.258 | 18.17 | 2.01 | 0.025 | 0.222 |
| 9.04250000000026 | 164.4 | 18.181 | 2.011 | 0.025 | 0.222 |
| 9.04500000000026 | 164.542 | 18.191 | 2.011 | 0.025 | 0.222 |
| 9.04750000000026 | 164.684 | 18.202 | 2.012 | 0.025 | 0.222 |
| 9.05000000000026 | 164.826 | 18.213 | 2.012 | 0.025 | 0.222 |
| 9.05250000000026 | 164.968 | 18.223 | 2.013 | 0.025 | 0.222 |
| 9.05500000000026 | 165.11 | 18.234 | 2.014 | 0.025 | 0.222 |
| 9.057500000000259 | 165.252 | 18.245 | 2.014 | 0.025 | 0.222 |
| 9.060000000000258 | 165.394 | 18.255 | 2.015 | 0.025 | 0.222 |
| 9.062500000000258 | 165.536 | 18.266 | 2.016 | 0.025 | 0.222 |
| 9.065000000000257 | 165.678 | 18.277 | 2.016 | 0.025 | 0.222 |
| 9.067500000000257 | 165.821 | 18.287 | 2.017 | 0.025 | 0.222 |
| 9.070000000000256 | 165.963 | 18.298 | 2.017 | 0.025 | 0.222 |
| 9.072500000000256 | 166.106 | 18.309 | 2.018 | 0.025 | 0.222 |
| 9.075000000000255 | 166.248 | 18.319 | 2.019 | 0.025 | 0.222 |
| 9.077500000000255 | 166.391 | 18.33 | 2.019 | 0.025 | 0.222 |
| 9.080000000000254 | 166.534 | 18.341 | 2.02 | 0.024 | 0.222 |
| 9.082500000000254 | 166.676 | 18.351 | 2.021 | 0.024 | 0.222 |
| 9.085000000000253 | 166.819 | 18.362 | 2.021 | 0.024 | 0.222 |
| 9.087500000000253 | 166.962 | 18.373 | 2.022 | 0.024 | 0.222 |
| 9.090000000000252 | 167.105 | 18.383 | 2.022 | 0.024 | 0.222 |
| 9.09250000000025 | 167.248 | 18.394 | 2.023 | 0.024 | 0.222 |
| 9.09500000000025 | 167.391 | 18.405 | 2.024 | 0.024 | 0.222 |
| 9.09750000000025 | 167.534 | 18.415 | 2.024 | 0.024 | 0.223 |
| 9.10000000000025 | 167.677 | 18.426 | 2.025 | 0.024 | 0.223 |
| 9.10250000000025 | 167.821 | 18.437 | 2.025 | 0.024 | 0.223 |
| 9.10500000000025 | 167.964 | 18.447 | 2.026 | 0.024 | 0.223 |
| 9.107500000000249 | 168.108 | 18.458 | 2.027 | 0.024 | 0.223 |
| 9.110000000000248 | 168.251 | 18.469 | 2.027 | 0.024 | 0.223 |
| 9.112500000000248 | 168.395 | 18.48 | 2.028 | 0.024 | 0.223 |
| 9.115000000000247 | 168.538 | 18.49 | 2.029 | 0.024 | 0.223 |
| 9.117500000000247 | 168.682 | 18.501 | 2.029 | 0.024 | 0.223 |
| 9.120000000000246 | 168.826 | 18.512 | 2.03 | 0.024 | 0.223 |
| 9.122500000000246 | 168.969 | 18.522 | 2.03 | 0.024 | 0.223 |
| 9.125000000000245 | 169.113 | 18.533 | 2.031 | 0.024 | 0.223 |
| 9.127500000000245 | 169.257 | 18.544 | 2.032 | 0.024 | 0.223 |
| 9.130000000000244 | 169.401 | 18.554 | 2.032 | 0.024 | 0.223 |
| 9.132500000000244 | 169.545 | 18.565 | 2.033 | 0.024 | 0.223 |
| 9.135000000000243 | 169.689 | 18.576 | 2.033 | 0.024 | 0.223 |
| 9.137500000000243 | 169.834 | 18.586 | 2.034 | 0.024 | 0.223 |
| 9.140000000000242 | 169.978 | 18.597 | 2.035 | 0.024 | 0.223 |
| 9.14250000000024 | 170.122 | 18.608 | 2.035 | 0.024 | 0.223 |
| 9.14500000000024 | 170.267 | 18.619 | 2.036 | 0.024 | 0.223 |
| 9.14750000000024 | 170.411 | 18.629 | 2.037 | 0.024 | 0.223 |
| 9.15000000000024 | 170.556 | 18.64 | 2.037 | 0.024 | 0.223 |
| 9.15250000000024 | 170.7 | 18.651 | 2.038 | 0.024 | 0.223 |
| 9.15500000000024 | 170.845 | 18.661 | 2.038 | 0.024 | 0.223 |
| 9.157500000000239 | 170.99 | 18.672 | 2.039 | 0.024 | 0.223 |
| 9.160000000000238 | 171.135 | 18.683 | 2.04 | 0.024 | 0.223 |
| 9.162500000000238 | 171.279 | 18.694 | 2.04 | 0.024 | 0.223 |
| 9.165000000000237 | 171.424 | 18.704 | 2.041 | 0.024 | 0.223 |
| 9.167500000000237 | 171.569 | 18.715 | 2.041 | 0.024 | 0.223 |
| 9.170000000000236 | 171.714 | 18.726 | 2.042 | 0.024 | 0.223 |
| 9.172500000000236 | 171.86 | 18.736 | 2.043 | 0.024 | 0.223 |
| 9.175000000000235 | 172.005 | 18.747 | 2.043 | 0.024 | 0.223 |
| 9.177500000000235 | 172.15 | 18.758 | 2.044 | 0.024 | 0.223 |
| 9.180000000000234 | 172.295 | 18.769 | 2.045 | 0.024 | 0.223 |
| 9.182500000000234 | 172.441 | 18.779 | 2.045 | 0.024 | 0.223 |
| 9.185000000000233 | 172.586 | 18.79 | 2.046 | 0.024 | 0.223 |
| 9.187500000000233 | 172.732 | 18.801 | 2.046 | 0.024 | 0.223 |
| 9.190000000000232 | 172.877 | 18.811 | 2.047 | 0.024 | 0.223 |
| 9.19250000000023 | 173.023 | 18.822 | 2.048 | 0.024 | 0.223 |
| 9.19500000000023 | 173.169 | 18.833 | 2.048 | 0.024 | 0.223 |
| 9.19750000000023 | 173.315 | 18.844 | 2.049 | 0.024 | 0.223 |
| 9.20000000000023 | 173.46 | 18.854 | 2.049 | 0.024 | 0.223 |
| 9.20250000000023 | 173.606 | 18.865 | 2.05 | 0.024 | 0.223 |
| 9.20500000000023 | 173.752 | 18.876 | 2.051 | 0.024 | 0.223 |
| 9.207500000000229 | 173.898 | 18.887 | 2.051 | 0.024 | 0.223 |
| 9.210000000000228 | 174.045 | 18.897 | 2.052 | 0.024 | 0.223 |
| 9.212500000000228 | 174.191 | 18.908 | 2.052 | 0.024 | 0.223 |
| 9.215000000000227 | 174.337 | 18.919 | 2.053 | 0.024 | 0.223 |
| 9.217500000000227 | 174.483 | 18.93 | 2.054 | 0.024 | 0.223 |
| 9.220000000000226 | 174.63 | 18.94 | 2.054 | 0.024 | 0.223 |
| 9.222500000000226 | 174.776 | 18.951 | 2.055 | 0.024 | 0.223 |
| 9.225000000000225 | 174.923 | 18.962 | 2.055 | 0.024 | 0.223 |
| 9.227500000000225 | 175.069 | 18.973 | 2.056 | 0.024 | 0.223 |
| 9.230000000000224 | 175.216 | 18.983 | 2.057 | 0.024 | 0.223 |
| 9.232500000000224 | 175.363 | 18.994 | 2.057 | 0.024 | 0.223 |
| 9.235000000000223 | 175.509 | 19.005 | 2.058 | 0.024 | 0.223 |
| 9.237500000000223 | 175.656 | 19.016 | 2.059 | 0.024 | 0.223 |
| 9.240000000000222 | 175.803 | 19.026 | 2.059 | 0.024 | 0.223 |
| 9.242500000000222 | 175.95 | 19.037 | 2.06 | 0.024 | 0.223 |
| 9.245000000000221 | 176.097 | 19.048 | 2.06 | 0.024 | 0.223 |
| 9.24750000000022 | 176.244 | 19.059 | 2.061 | 0.024 | 0.223 |
| 9.25000000000022 | 176.392 | 19.069 | 2.062 | 0.024 | 0.223 |
| 9.25250000000022 | 176.539 | 19.08 | 2.062 | 0.024 | 0.223 |
| 9.25500000000022 | 176.686 | 19.091 | 2.063 | 0.024 | 0.223 |
| 9.257500000000219 | 176.834 | 19.102 | 2.063 | 0.024 | 0.223 |
| 9.260000000000218 | 176.981 | 19.112 | 2.064 | 0.024 | 0.223 |
| 9.262500000000218 | 177.129 | 19.123 | 2.065 | 0.024 | 0.223 |
| 9.265000000000217 | 177.276 | 19.134 | 2.065 | 0.024 | 0.223 |
| 9.267500000000217 | 177.424 | 19.145 | 2.066 | 0.024 | 0.223 |
| 9.270000000000216 | 177.572 | 19.156 | 2.066 | 0.024 | 0.223 |
| 9.272500000000216 | 177.719 | 19.166 | 2.067 | 0.024 | 0.223 |
| 9.275000000000215 | 177.867 | 19.177 | 2.068 | 0.024 | 0.223 |
| 9.277500000000215 | 178.015 | 19.188 | 2.068 | 0.024 | 0.223 |
| 9.280000000000214 | 178.163 | 19.199 | 2.069 | 0.024 | 0.223 |
| 9.282500000000214 | 178.311 | 19.209 | 2.069 | 0.024 | 0.223 |
| 9.285000000000213 | 178.459 | 19.22 | 2.07 | 0.024 | 0.223 |
| 9.287500000000213 | 178.608 | 19.231 | 2.071 | 0.024 | 0.223 |
| 9.290000000000212 | 178.756 | 19.242 | 2.071 | 0.024 | 0.223 |
| 9.29250000000021 | 178.904 | 19.253 | 2.072 | 0.024 | 0.223 |
| 9.29500000000021 | 179.052 | 19.263 | 2.072 | 0.024 | 0.223 |
| 9.29750000000021 | 179.201 | 19.274 | 2.073 | 0.024 | 0.223 |
| 9.30000000000021 | 179.349 | 19.285 | 2.074 | 0.024 | 0.223 |
| 9.30250000000021 | 179.498 | 19.296 | 2.074 | 0.024 | 0.223 |
| 9.30500000000021 | 179.647 | 19.306 | 2.075 | 0.024 | 0.223 |
| 9.307500000000209 | 179.795 | 19.317 | 2.075 | 0.024 | 0.223 |
| 9.310000000000208 | 179.944 | 19.328 | 2.076 | 0.024 | 0.223 |
| 9.312500000000208 | 180.093 | 19.339 | 2.077 | 0.024 | 0.223 |
| 9.315000000000207 | 180.242 | 19.35 | 2.077 | 0.024 | 0.223 |
| 9.317500000000207 | 180.391 | 19.36 | 2.078 | 0.024 | 0.223 |
| 9.320000000000206 | 180.54 | 19.371 | 2.078 | 0.024 | 0.223 |
| 9.322500000000206 | 180.689 | 19.382 | 2.079 | 0.024 | 0.223 |
| 9.325000000000205 | 180.838 | 19.393 | 2.08 | 0.024 | 0.223 |
| 9.327500000000205 | 180.988 | 19.404 | 2.08 | 0.024 | 0.223 |
| 9.330000000000204 | 181.137 | 19.414 | 2.081 | 0.024 | 0.223 |
| 9.332500000000204 | 181.286 | 19.425 | 2.081 | 0.024 | 0.223 |
| 9.335000000000203 | 181.436 | 19.436 | 2.082 | 0.024 | 0.223 |
| 9.337500000000203 | 181.585 | 19.447 | 2.083 | 0.024 | 0.223 |
| 9.340000000000202 | 181.735 | 19.458 | 2.083 | 0.024 | 0.223 |
| 9.3425000000002 | 181.885 | 19.469 | 2.084 | 0.024 | 0.223 |
| 9.3450000000002 | 182.034 | 19.479 | 2.084 | 0.024 | 0.223 |
| 9.3475000000002 | 182.184 | 19.49 | 2.085 | 0.024 | 0.223 |
| 9.3500000000002 | 182.334 | 19.501 | 2.086 | 0.024 | 0.223 |
| 9.3525000000002 | 182.484 | 19.512 | 2.086 | 0.024 | 0.223 |
| 9.3550000000002 | 182.634 | 19.523 | 2.087 | 0.024 | 0.223 |
| 9.357500000000199 | 182.784 | 19.533 | 2.087 | 0.024 | 0.223 |
| 9.360000000000198 | 182.934 | 19.544 | 2.088 | 0.024 | 0.223 |
| 9.362500000000198 | 183.084 | 19.555 | 2.089 | 0.024 | 0.223 |
| 9.365000000000197 | 183.235 | 19.566 | 2.089 | 0.024 | 0.223 |
| 9.367500000000195 | 183.385 | 19.577 | 2.09 | 0.024 | 0.223 |
| 9.370000000000196 | 183.535 | 19.588 | 2.09 | 0.024 | 0.223 |
| 9.372500000000194 | 183.686 | 19.598 | 2.091 | 0.024 | 0.223 |
| 9.375000000000195 | 183.836 | 19.609 | 2.092 | 0.024 | 0.223 |
| 9.377500000000193 | 183.987 | 19.62 | 2.092 | 0.024 | 0.223 |
| 9.380000000000194 | 184.138 | 19.631 | 2.093 | 0.024 | 0.223 |
| 9.382500000000192 | 184.288 | 19.642 | 2.093 | 0.024 | 0.223 |
| 9.385000000000193 | 184.439 | 19.653 | 2.094 | 0.024 | 0.223 |
| 9.387500000000191 | 184.59 | 19.663 | 2.095 | 0.024 | 0.223 |
| 9.390000000000192 | 184.741 | 19.674 | 2.095 | 0.024 | 0.223 |
| 9.39250000000019 | 184.892 | 19.685 | 2.096 | 0.024 | 0.223 |
| 9.39500000000019 | 185.043 | 19.696 | 2.096 | 0.024 | 0.223 |
| 9.39750000000019 | 185.194 | 19.707 | 2.097 | 0.024 | 0.223 |
| 9.40000000000019 | 185.345 | 19.718 | 2.098 | 0.024 | 0.223 |
| 9.40250000000019 | 185.497 | 19.728 | 2.098 | 0.024 | 0.223 |
| 9.40500000000019 | 185.648 | 19.739 | 2.099 | 0.024 | 0.223 |
| 9.407500000000187 | 185.8 | 19.75 | 2.099 | 0.024 | 0.223 |
| 9.410000000000188 | 185.951 | 19.761 | 2.1 | 0.024 | 0.223 |
| 9.412500000000186 | 186.103 | 19.772 | 2.101 | 0.024 | 0.223 |
| 9.415000000000187 | 186.254 | 19.783 | 2.101 | 0.024 | 0.223 |
| 9.417500000000187 | 186.406 | 19.794 | 2.102 | 0.024 | 0.223 |
| 9.420000000000186 | 186.558 | 19.804 | 2.102 | 0.024 | 0.223 |
| 9.422500000000184 | 186.709 | 19.815 | 2.103 | 0.024 | 0.223 |
| 9.425000000000185 | 186.861 | 19.826 | 2.104 | 0.024 | 0.223 |
| 9.427500000000185 | 187.013 | 19.837 | 2.104 | 0.024 | 0.223 |
| 9.430000000000184 | 187.165 | 19.848 | 2.105 | 0.024 | 0.223 |
| 9.432500000000182 | 187.317 | 19.859 | 2.105 | 0.024 | 0.223 |
| 9.435000000000183 | 187.47 | 19.87 | 2.106 | 0.024 | 0.223 |
| 9.437500000000183 | 187.622 | 19.88 | 2.107 | 0.024 | 0.223 |
| 9.440000000000182 | 187.774 | 19.891 | 2.107 | 0.024 | 0.223 |
| 9.44250000000018 | 187.926 | 19.902 | 2.108 | 0.024 | 0.223 |
| 9.445000000000181 | 188.079 | 19.913 | 2.108 | 0.024 | 0.223 |
| 9.447500000000181 | 188.231 | 19.924 | 2.109 | 0.024 | 0.223 |
| 9.45000000000018 | 188.384 | 19.935 | 2.11 | 0.024 | 0.223 |
| 9.45250000000018 | 188.536 | 19.946 | 2.11 | 0.024 | 0.223 |
| 9.45500000000018 | 188.689 | 19.957 | 2.111 | 0.024 | 0.223 |
| 9.457500000000177 | 188.842 | 19.967 | 2.111 | 0.024 | 0.223 |
| 9.460000000000178 | 188.995 | 19.978 | 2.112 | 0.024 | 0.223 |
| 9.462500000000176 | 189.148 | 19.989 | 2.112 | 0.024 | 0.223 |
| 9.465000000000177 | 189.301 | 20 | 2.113 | 0.024 | 0.223 |
| 9.467500000000177 | 189.454 | 20.011 | 2.114 | 0.024 | 0.223 |
| 9.470000000000176 | 189.607 | 20.022 | 2.114 | 0.024 | 0.223 |
| 9.472500000000174 | 189.76 | 20.033 | 2.115 | 0.024 | 0.223 |
| 9.475000000000176 | 189.913 | 20.044 | 2.115 | 0.024 | 0.223 |
| 9.477500000000175 | 190.066 | 20.054 | 2.116 | 0.024 | 0.223 |
| 9.480000000000175 | 190.22 | 20.065 | 2.117 | 0.024 | 0.223 |
| 9.482500000000172 | 190.373 | 20.076 | 2.117 | 0.024 | 0.223 |
| 9.485000000000174 | 190.527 | 20.087 | 2.118 | 0.024 | 0.223 |
| 9.487500000000173 | 190.68 | 20.098 | 2.118 | 0.024 | 0.223 |
| 9.490000000000173 | 190.834 | 20.109 | 2.119 | 0.024 | 0.223 |
| 9.49250000000017 | 190.988 | 20.12 | 2.12 | 0.024 | 0.223 |
| 9.495000000000172 | 191.141 | 20.131 | 2.12 | 0.024 | 0.223 |
| 9.497500000000171 | 191.295 | 20.142 | 2.121 | 0.024 | 0.223 |
| 9.50000000000017 | 191.449 | 20.153 | 2.121 | 0.024 | 0.223 |
| 9.50250000000017 | 191.603 | 20.163 | 2.122 | 0.023 | 0.223 |
| 9.50500000000017 | 191.757 | 20.174 | 2.122 | 0.023 | 0.223 |
| 9.50750000000017 | 191.911 | 20.185 | 2.123 | 0.023 | 0.223 |
| 9.510000000000169 | 192.065 | 20.196 | 2.124 | 0.023 | 0.223 |
| 9.512500000000168 | 192.22 | 20.207 | 2.124 | 0.023 | 0.223 |
| 9.515000000000168 | 192.374 | 20.218 | 2.125 | 0.023 | 0.223 |
| 9.517500000000167 | 192.528 | 20.229 | 2.125 | 0.023 | 0.223 |
| 9.520000000000167 | 192.683 | 20.24 | 2.126 | 0.023 | 0.223 |
| 9.522500000000166 | 192.837 | 20.251 | 2.127 | 0.023 | 0.223 |
| 9.525000000000166 | 192.992 | 20.262 | 2.127 | 0.023 | 0.223 |
| 9.527500000000165 | 193.147 | 20.273 | 2.128 | 0.023 | 0.223 |
| 9.530000000000165 | 193.301 | 20.283 | 2.128 | 0.023 | 0.223 |
| 9.532500000000164 | 193.456 | 20.294 | 2.129 | 0.023 | 0.223 |
| 9.535000000000164 | 193.611 | 20.305 | 2.13 | 0.023 | 0.223 |
| 9.537500000000163 | 193.766 | 20.316 | 2.13 | 0.023 | 0.223 |
| 9.540000000000163 | 193.921 | 20.327 | 2.131 | 0.023 | 0.223 |
| 9.542500000000162 | 194.076 | 20.338 | 2.131 | 0.023 | 0.223 |
| 9.545000000000162 | 194.231 | 20.349 | 2.132 | 0.023 | 0.223 |
| 9.547500000000161 | 194.386 | 20.36 | 2.132 | 0.023 | 0.223 |
| 9.55000000000016 | 194.542 | 20.371 | 2.133 | 0.023 | 0.223 |
| 9.55250000000016 | 194.697 | 20.382 | 2.134 | 0.023 | 0.223 |
| 9.55500000000016 | 194.852 | 20.393 | 2.134 | 0.023 | 0.223 |
| 9.55750000000016 | 195.008 | 20.404 | 2.135 | 0.023 | 0.223 |
| 9.560000000000159 | 195.163 | 20.415 | 2.135 | 0.023 | 0.223 |
| 9.562500000000158 | 195.319 | 20.426 | 2.136 | 0.023 | 0.223 |
| 9.565000000000158 | 195.475 | 20.436 | 2.137 | 0.023 | 0.223 |
| 9.567500000000157 | 195.63 | 20.447 | 2.137 | 0.023 | 0.223 |
| 9.570000000000157 | 195.786 | 20.458 | 2.138 | 0.023 | 0.223 |
| 9.572500000000156 | 195.942 | 20.469 | 2.138 | 0.023 | 0.223 |
| 9.575000000000156 | 196.098 | 20.48 | 2.139 | 0.023 | 0.223 |
| 9.577500000000155 | 196.254 | 20.491 | 2.14 | 0.023 | 0.223 |
| 9.580000000000155 | 196.41 | 20.502 | 2.14 | 0.023 | 0.223 |
| 9.582500000000154 | 196.566 | 20.513 | 2.141 | 0.023 | 0.223 |
| 9.585000000000154 | 196.722 | 20.524 | 2.141 | 0.023 | 0.223 |
| 9.587500000000153 | 196.879 | 20.535 | 2.142 | 0.023 | 0.223 |
| 9.590000000000153 | 197.035 | 20.546 | 2.142 | 0.023 | 0.223 |
| 9.592500000000152 | 197.192 | 20.557 | 2.143 | 0.023 | 0.223 |
| 9.595000000000152 | 197.348 | 20.568 | 2.144 | 0.023 | 0.223 |
| 9.597500000000151 | 197.505 | 20.579 | 2.144 | 0.023 | 0.223 |
| 9.60000000000015 | 197.661 | 20.59 | 2.145 | 0.023 | 0.223 |
| 9.60250000000015 | 197.818 | 20.601 | 2.145 | 0.023 | 0.223 |
| 9.60500000000015 | 197.975 | 20.612 | 2.146 | 0.023 | 0.223 |
| 9.60750000000015 | 198.131 | 20.623 | 2.147 | 0.023 | 0.223 |
| 9.610000000000149 | 198.288 | 20.634 | 2.147 | 0.023 | 0.223 |
| 9.612500000000148 | 198.445 | 20.645 | 2.148 | 0.023 | 0.223 |
| 9.615000000000148 | 198.602 | 20.655 | 2.148 | 0.023 | 0.223 |
| 9.617500000000147 | 198.759 | 20.666 | 2.149 | 0.023 | 0.223 |
| 9.620000000000147 | 198.917 | 20.677 | 2.149 | 0.023 | 0.223 |
| 9.622500000000146 | 199.074 | 20.688 | 2.15 | 0.023 | 0.223 |
| 9.625000000000146 | 199.231 | 20.699 | 2.151 | 0.023 | 0.223 |
| 9.627500000000145 | 199.389 | 20.71 | 2.151 | 0.023 | 0.223 |
| 9.630000000000145 | 199.546 | 20.721 | 2.152 | 0.023 | 0.223 |
| 9.632500000000144 | 199.704 | 20.732 | 2.152 | 0.023 | 0.223 |
| 9.635000000000144 | 199.861 | 20.743 | 2.153 | 0.023 | 0.223 |
| 9.637500000000143 | 200.019 | 20.754 | 2.153 | 0.023 | 0.223 |
| 9.640000000000143 | 200.176 | 20.765 | 2.154 | 0.023 | 0.223 |
| 9.642500000000142 | 200.334 | 20.776 | 2.155 | 0.023 | 0.223 |
| 9.645000000000142 | 200.492 | 20.787 | 2.155 | 0.023 | 0.223 |
| 9.647500000000141 | 200.65 | 20.798 | 2.156 | 0.023 | 0.223 |
| 9.65000000000014 | 200.808 | 20.809 | 2.156 | 0.023 | 0.223 |
| 9.65250000000014 | 200.966 | 20.82 | 2.157 | 0.023 | 0.223 |
| 9.65500000000014 | 201.124 | 20.831 | 2.158 | 0.023 | 0.223 |
| 9.65750000000014 | 201.282 | 20.842 | 2.158 | 0.023 | 0.223 |
| 9.660000000000139 | 201.441 | 20.853 | 2.159 | 0.023 | 0.223 |
| 9.662500000000138 | 201.599 | 20.864 | 2.159 | 0.023 | 0.223 |
| 9.665000000000138 | 201.757 | 20.875 | 2.16 | 0.023 | 0.223 |
| 9.667500000000137 | 201.916 | 20.886 | 2.16 | 0.023 | 0.223 |
| 9.670000000000137 | 202.074 | 20.897 | 2.161 | 0.023 | 0.223 |
| 9.672500000000136 | 202.233 | 20.908 | 2.162 | 0.023 | 0.223 |
| 9.675000000000136 | 202.392 | 20.919 | 2.162 | 0.023 | 0.223 |
| 9.677500000000135 | 202.55 | 20.93 | 2.163 | 0.023 | 0.223 |
| 9.680000000000135 | 202.709 | 20.941 | 2.163 | 0.023 | 0.223 |
| 9.682500000000134 | 202.868 | 20.952 | 2.164 | 0.023 | 0.223 |
| 9.685000000000134 | 203.027 | 20.963 | 2.164 | 0.023 | 0.223 |
| 9.687500000000133 | 203.186 | 20.974 | 2.165 | 0.023 | 0.223 |
| 9.690000000000133 | 203.345 | 20.985 | 2.166 | 0.023 | 0.223 |
| 9.692500000000132 | 203.504 | 20.996 | 2.166 | 0.023 | 0.223 |
| 9.695000000000132 | 203.664 | 21.007 | 2.167 | 0.023 | 0.223 |
| 9.697500000000131 | 203.823 | 21.018 | 2.167 | 0.023 | 0.223 |
| 9.70000000000013 | 203.982 | 21.029 | 2.168 | 0.023 | 0.223 |
| 9.70250000000013 | 204.142 | 21.04 | 2.169 | 0.023 | 0.224 |
| 9.70500000000013 | 204.301 | 21.051 | 2.169 | 0.023 | 0.224 |
| 9.70750000000013 | 204.461 | 21.062 | 2.17 | 0.023 | 0.224 |
| 9.710000000000129 | 204.62 | 21.073 | 2.17 | 0.023 | 0.224 |
| 9.712500000000128 | 204.78 | 21.084 | 2.171 | 0.023 | 0.224 |
| 9.715000000000128 | 204.94 | 21.095 | 2.171 | 0.023 | 0.224 |
| 9.717500000000127 | 205.1 | 21.106 | 2.172 | 0.023 | 0.224 |
| 9.720000000000127 | 205.26 | 21.117 | 2.173 | 0.023 | 0.224 |
| 9.722500000000126 | 205.42 | 21.128 | 2.173 | 0.023 | 0.224 |
| 9.725000000000126 | 205.58 | 21.139 | 2.174 | 0.023 | 0.224 |
| 9.727500000000125 | 205.74 | 21.15 | 2.174 | 0.023 | 0.224 |
| 9.730000000000125 | 205.9 | 21.161 | 2.175 | 0.023 | 0.224 |
| 9.732500000000124 | 206.06 | 21.172 | 2.175 | 0.023 | 0.224 |
| 9.735000000000124 | 206.221 | 21.183 | 2.176 | 0.023 | 0.224 |
| 9.737500000000123 | 206.381 | 21.194 | 2.177 | 0.023 | 0.224 |
| 9.740000000000123 | 206.541 | 21.205 | 2.177 | 0.023 | 0.224 |
| 9.742500000000122 | 206.702 | 21.217 | 2.178 | 0.023 | 0.224 |
| 9.745000000000122 | 206.863 | 21.228 | 2.178 | 0.023 | 0.224 |
| 9.747500000000121 | 207.023 | 21.239 | 2.179 | 0.023 | 0.224 |
| 9.75000000000012 | 207.184 | 21.25 | 2.179 | 0.023 | 0.224 |
| 9.75250000000012 | 207.345 | 21.261 | 2.18 | 0.023 | 0.224 |
| 9.75500000000012 | 207.506 | 21.272 | 2.181 | 0.023 | 0.224 |
| 9.75750000000012 | 207.667 | 21.283 | 2.181 | 0.023 | 0.224 |
| 9.760000000000119 | 207.828 | 21.294 | 2.182 | 0.023 | 0.224 |
| 9.762500000000118 | 207.989 | 21.305 | 2.182 | 0.023 | 0.224 |
| 9.765000000000118 | 208.15 | 21.316 | 2.183 | 0.023 | 0.224 |
| 9.767500000000117 | 208.311 | 21.327 | 2.183 | 0.023 | 0.224 |
| 9.770000000000117 | 208.472 | 21.338 | 2.184 | 0.023 | 0.224 |
| 9.772500000000116 | 208.634 | 21.349 | 2.185 | 0.023 | 0.224 |
| 9.775000000000116 | 208.795 | 21.36 | 2.185 | 0.023 | 0.224 |
| 9.777500000000115 | 208.957 | 21.371 | 2.186 | 0.023 | 0.224 |
| 9.780000000000115 | 209.118 | 21.382 | 2.186 | 0.023 | 0.224 |
| 9.782500000000114 | 209.28 | 21.393 | 2.187 | 0.023 | 0.224 |
| 9.785000000000114 | 209.441 | 21.404 | 2.187 | 0.023 | 0.224 |
| 9.787500000000113 | 209.603 | 21.415 | 2.188 | 0.023 | 0.224 |
| 9.790000000000113 | 209.765 | 21.426 | 2.189 | 0.023 | 0.224 |
| 9.792500000000112 | 209.927 | 21.438 | 2.189 | 0.023 | 0.224 |
| 9.795000000000112 | 210.089 | 21.449 | 2.19 | 0.023 | 0.224 |
| 9.797500000000111 | 210.251 | 21.46 | 2.19 | 0.023 | 0.224 |
| 9.80000000000011 | 210.413 | 21.471 | 2.191 | 0.023 | 0.224 |
| 9.80250000000011 | 210.575 | 21.482 | 2.191 | 0.023 | 0.224 |
| 9.80500000000011 | 210.738 | 21.493 | 2.192 | 0.023 | 0.224 |
| 9.80750000000011 | 210.9 | 21.504 | 2.193 | 0.023 | 0.224 |
| 9.810000000000109 | 211.062 | 21.515 | 2.193 | 0.023 | 0.224 |
| 9.812500000000108 | 211.225 | 21.526 | 2.194 | 0.023 | 0.224 |
| 9.815000000000108 | 211.387 | 21.537 | 2.194 | 0.023 | 0.224 |
| 9.817500000000107 | 211.55 | 21.548 | 2.195 | 0.023 | 0.224 |
| 9.820000000000107 | 211.712 | 21.559 | 2.195 | 0.023 | 0.224 |
| 9.822500000000106 | 211.875 | 21.57 | 2.196 | 0.023 | 0.224 |
| 9.825000000000106 | 212.038 | 21.581 | 2.197 | 0.023 | 0.224 |
| 9.827500000000105 | 212.201 | 21.593 | 2.197 | 0.023 | 0.224 |
| 9.830000000000105 | 212.364 | 21.604 | 2.198 | 0.023 | 0.224 |
| 9.832500000000104 | 212.527 | 21.615 | 2.198 | 0.023 | 0.224 |
| 9.835000000000104 | 212.69 | 21.626 | 2.199 | 0.023 | 0.224 |
| 9.837500000000103 | 212.853 | 21.637 | 2.199 | 0.023 | 0.224 |
| 9.840000000000103 | 213.016 | 21.648 | 2.2 | 0.023 | 0.224 |
| 9.842500000000102 | 213.18 | 21.659 | 2.201 | 0.023 | 0.224 |
| 9.8450000000001 | 213.343 | 21.67 | 2.201 | 0.023 | 0.224 |
| 9.847500000000101 | 213.506 | 21.681 | 2.202 | 0.023 | 0.224 |
| 9.8500000000001 | 213.67 | 21.692 | 2.202 | 0.023 | 0.224 |
| 9.8525000000001 | 213.833 | 21.703 | 2.203 | 0.023 | 0.224 |
| 9.8550000000001 | 213.997 | 21.715 | 2.203 | 0.023 | 0.224 |
| 9.8575000000001 | 214.161 | 21.726 | 2.204 | 0.023 | 0.224 |
| 9.860000000000097 | 214.325 | 21.737 | 2.205 | 0.023 | 0.224 |
| 9.862500000000098 | 214.488 | 21.748 | 2.205 | 0.023 | 0.224 |
| 9.865000000000096 | 214.652 | 21.759 | 2.206 | 0.023 | 0.224 |
| 9.867500000000097 | 214.816 | 21.77 | 2.206 | 0.023 | 0.224 |
| 9.870000000000095 | 214.98 | 21.781 | 2.207 | 0.023 | 0.224 |
| 9.872500000000096 | 215.144 | 21.792 | 2.207 | 0.023 | 0.224 |
| 9.875000000000094 | 215.309 | 21.803 | 2.208 | 0.023 | 0.224 |
| 9.877500000000095 | 215.473 | 21.815 | 2.209 | 0.023 | 0.224 |
| 9.880000000000093 | 215.637 | 21.826 | 2.209 | 0.023 | 0.224 |
| 9.882500000000094 | 215.802 | 21.837 | 2.21 | 0.023 | 0.224 |
| 9.885000000000092 | 215.966 | 21.848 | 2.21 | 0.023 | 0.224 |
| 9.887500000000093 | 216.131 | 21.859 | 2.211 | 0.023 | 0.224 |
| 9.890000000000091 | 216.295 | 21.87 | 2.211 | 0.023 | 0.224 |
| 9.89250000000009 | 216.46 | 21.881 | 2.212 | 0.023 | 0.224 |
| 9.89500000000009 | 216.625 | 21.892 | 2.212 | 0.023 | 0.224 |
| 9.89750000000009 | 216.789 | 21.903 | 2.213 | 0.023 | 0.224 |
| 9.90000000000009 | 216.954 | 21.915 | 2.214 | 0.023 | 0.224 |
| 9.90250000000009 | 217.119 | 21.926 | 2.214 | 0.023 | 0.224 |
| 9.90500000000009 | 217.284 | 21.937 | 2.215 | 0.023 | 0.224 |
| 9.90750000000009 | 217.449 | 21.948 | 2.215 | 0.023 | 0.224 |
| 9.910000000000087 | 217.615 | 21.959 | 2.216 | 0.023 | 0.224 |
| 9.912500000000088 | 217.78 | 21.97 | 2.216 | 0.023 | 0.224 |
| 9.915000000000086 | 217.945 | 21.981 | 2.217 | 0.023 | 0.224 |
| 9.917500000000087 | 218.111 | 21.992 | 2.218 | 0.023 | 0.224 |
| 9.920000000000087 | 218.276 | 22.004 | 2.218 | 0.023 | 0.224 |
| 9.922500000000086 | 218.441 | 22.015 | 2.219 | 0.023 | 0.224 |
| 9.925000000000084 | 218.607 | 22.026 | 2.219 | 0.023 | 0.224 |
| 9.927500000000085 | 218.773 | 22.037 | 2.22 | 0.023 | 0.224 |
| 9.930000000000085 | 218.938 | 22.048 | 2.22 | 0.023 | 0.224 |
| 9.932500000000084 | 219.104 | 22.059 | 2.221 | 0.023 | 0.224 |
| 9.935000000000082 | 219.27 | 22.07 | 2.221 | 0.023 | 0.224 |
| 9.937500000000083 | 219.436 | 22.082 | 2.222 | 0.023 | 0.224 |
| 9.940000000000083 | 219.602 | 22.093 | 2.223 | 0.022 | 0.224 |
| 9.942500000000082 | 219.768 | 22.104 | 2.223 | 0.022 | 0.224 |
| 9.94500000000008 | 219.934 | 22.115 | 2.224 | 0.022 | 0.224 |
| 9.947500000000081 | 220.1 | 22.126 | 2.224 | 0.022 | 0.224 |
| 9.95000000000008 | 220.267 | 22.137 | 2.225 | 0.022 | 0.224 |
| 9.95250000000008 | 220.433 | 22.149 | 2.225 | 0.022 | 0.224 |
| 9.95500000000008 | 220.599 | 22.16 | 2.226 | 0.022 | 0.224 |
| 9.95750000000008 | 220.766 | 22.171 | 2.227 | 0.022 | 0.224 |
| 9.960000000000077 | 220.932 | 22.182 | 2.227 | 0.022 | 0.224 |
| 9.962500000000079 | 221.099 | 22.193 | 2.228 | 0.022 | 0.224 |
| 9.965000000000076 | 221.266 | 22.204 | 2.228 | 0.022 | 0.224 |
| 9.967500000000078 | 221.433 | 22.215 | 2.229 | 0.022 | 0.224 |
| 9.970000000000077 | 221.599 | 22.227 | 2.229 | 0.022 | 0.224 |
| 9.972500000000077 | 221.766 | 22.238 | 2.23 | 0.022 | 0.224 |
| 9.975000000000074 | 221.933 | 22.249 | 2.23 | 0.022 | 0.224 |
| 9.977500000000076 | 222.1 | 22.26 | 2.231 | 0.022 | 0.224 |
| 9.980000000000075 | 222.267 | 22.271 | 2.232 | 0.022 | 0.224 |
| 9.982500000000075 | 222.435 | 22.282 | 2.232 | 0.022 | 0.224 |
| 9.985000000000072 | 222.602 | 22.294 | 2.233 | 0.022 | 0.224 |
| 9.987500000000074 | 222.769 | 22.305 | 2.233 | 0.022 | 0.224 |
| 9.990000000000073 | 222.937 | 22.316 | 2.234 | 0.022 | 0.224 |
| 9.992500000000073 | 223.104 | 22.327 | 2.234 | 0.022 | 0.224 |
| 9.995000000000072 | 223.272 | 22.338 | 2.235 | 0.022 | 0.224 |
| 9.997500000000072 | 223.439 | 22.35 | 2.236 | 0.022 | 0.224 |
| 10.00000000000007 | 223.607 | 22.361 | 2.236 | 0.022 | 0.224 |